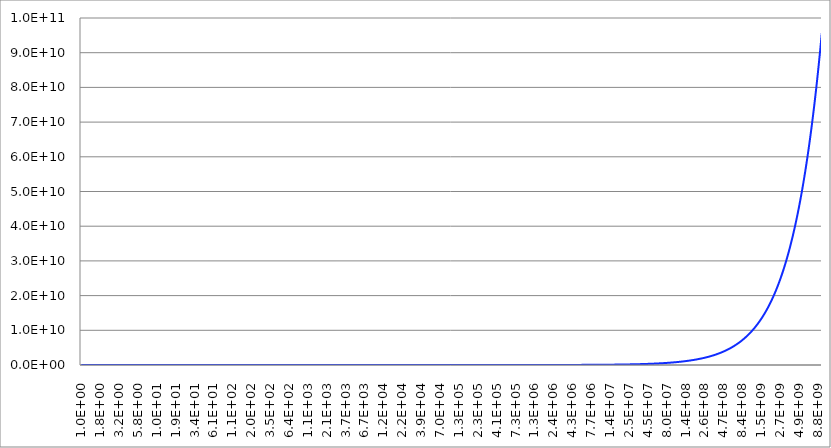
| Category | Series 1 | Series 0 | Series 2 |
|---|---|---|---|
| 1.0 |  |  | -0.108 |
| 1.011579454259899 |  |  | -0.137 |
| 1.023292992280754 |  |  | -0.161 |
| 1.035142166679344 |  |  | -0.181 |
| 1.0471285480509 |  |  | -0.197 |
| 1.059253725177289 |  |  | -0.21 |
| 1.071519305237607 |  |  | -0.219 |
| 1.083926914021204 |  |  | -0.226 |
| 1.096478196143186 |  |  | -0.23 |
| 1.109174815262402 |  |  | -0.232 |
| 1.122018454301964 |  |  | -0.232 |
| 1.135010815672316 |  |  | -0.231 |
| 1.148153621496884 |  |  | -0.228 |
| 1.161448613840344 |  |  | -0.224 |
| 1.174897554939531 |  |  | -0.219 |
| 1.18850222743702 |  |  | -0.213 |
| 1.202264434617414 |  |  | -0.207 |
| 1.216186000646369 |  |  | -0.2 |
| 1.230268770812383 |  |  | -0.192 |
| 1.244514611771387 |  |  | -0.184 |
| 1.258925411794169 |  |  | -0.176 |
| 1.273503081016663 |  |  | -0.167 |
| 1.288249551693136 |  |  | -0.158 |
| 1.303166778452301 |  |  | -0.149 |
| 1.31825673855641 |  |  | -0.14 |
| 1.333521432163326 |  |  | -0.131 |
| 1.348962882591656 |  |  | -0.121 |
| 1.364583136588927 |  |  | -0.112 |
| 1.380384264602887 |  |  | -0.102 |
| 1.39636836105594 |  |  | -0.092 |
| 1.412537544622757 |  |  | -0.082 |
| 1.428893958511106 |  |  | -0.072 |
| 1.445439770745931 |  |  | -0.062 |
| 1.462177174456721 |  |  | -0.052 |
| 1.479108388168211 |  |  | -0.042 |
| 1.496235656094437 |  |  | -0.031 |
| 1.513561248436212 |  |  | -0.021 |
| 1.531087461682034 |  |  | -0.01 |
| 1.548816618912485 |  |  | 0 |
| 1.566751070108153 |  |  | 0.011 |
| 1.584893192461118 |  |  | 0.022 |
| 1.603245390690046 |  |  | 0.033 |
| 1.621810097358934 |  |  | 0.044 |
| 1.640589773199544 |  |  | 0.055 |
| 1.659586907437565 |  |  | 0.066 |
| 1.678804018122565 |  |  | 0.078 |
| 1.698243652461749 |  |  | 0.089 |
| 1.717908387157593 |  |  | 0.101 |
| 1.737800828749381 |  |  | 0.112 |
| 1.757923613958698 |  |  | 0.124 |
| 1.778279410038928 |  |  | 0.136 |
| 1.798870915128794 |  |  | 0.148 |
| 1.81970085860999 |  |  | 0.161 |
| 1.840772001468962 |  |  | 0.173 |
| 1.862087136662874 |  |  | 0.185 |
| 1.883649089489807 |  |  | 0.198 |
| 1.905460717963254 |  |  | 0.211 |
| 1.927524913190943 |  |  | 0.224 |
| 1.949844599758053 |  |  | 0.237 |
| 1.972422736114861 |  |  | 0.25 |
| 1.995262314968887 |  |  | 0.263 |
| 2.018366363681569 |  |  | 0.277 |
| 2.041737944669537 |  |  | 0.291 |
| 2.065380155810538 |  |  | 0.305 |
| 2.089296130854049 |  |  | 0.319 |
| 2.113489039836656 |  |  | 0.333 |
| 2.137962089502242 |  |  | 0.347 |
| 2.16271852372703 |  |  | 0.362 |
| 2.187761623949563 |  |  | 0.377 |
| 2.213094709605648 |  |  | 0.392 |
| 2.23872113856835 |  |  | 0.407 |
| 2.264644307593071 |  |  | 0.422 |
| 2.290867652767784 |  |  | 0.438 |
| 2.31739464996849 |  |  | 0.454 |
| 2.344228815319933 |  |  | 0.47 |
| 2.371373705661667 |  |  | 0.486 |
| 2.398832919019502 |  |  | 0.503 |
| 2.426610095082428 |  |  | 0.52 |
| 2.454708915685043 |  |  | 0.537 |
| 2.483133105295583 |  |  | 0.554 |
| 2.511886431509593 |  |  | 0.571 |
| 2.540972705549318 |  |  | 0.589 |
| 2.570395782768878 |  |  | 0.607 |
| 2.600159563165286 |  |  | 0.626 |
| 2.630267991895396 |  |  | 0.644 |
| 2.660725059798824 |  |  | 0.663 |
| 2.69153480392693 |  |  | 0.682 |
| 2.722701308077927 |  |  | 0.701 |
| 2.754228703338182 |  |  | 0.721 |
| 2.786121168629786 |  |  | 0.741 |
| 2.818382931264471 |  |  | 0.761 |
| 2.851018267503926 |  |  | 0.782 |
| 2.884031503126623 |  |  | 0.803 |
| 2.917427014001185 |  |  | 0.824 |
| 2.951209226666404 |  |  | 0.846 |
| 2.985382618917978 |  |  | 0.868 |
| 3.019951720402035 |  |  | 0.89 |
| 3.054921113215533 |  |  | 0.913 |
| 3.09029543251361 |  |  | 0.936 |
| 3.126079367123975 |  |  | 0.959 |
| 3.1622776601684 |  |  | 0.983 |
| 3.198895109691419 |  |  | 1.007 |
| 3.235936569296304 |  |  | 1.031 |
| 3.273406948788404 |  |  | 1.056 |
| 3.311311214825934 |  |  | 1.081 |
| 3.3496543915783 |  |  | 1.107 |
| 3.388441561392049 |  |  | 1.133 |
| 3.427677865464528 |  |  | 1.159 |
| 3.467368504525341 |  |  | 1.186 |
| 3.507518739525706 |  |  | 1.213 |
| 3.548133892335781 |  |  | 1.241 |
| 3.589219346450079 |  |  | 1.269 |
| 3.63078054770104 |  |  | 1.298 |
| 3.672823004980874 |  |  | 1.327 |
| 3.715352290971754 |  |  | 1.357 |
| 3.75837404288447 |  |  | 1.387 |
| 3.801893963205642 |  |  | 1.417 |
| 3.845917820453566 |  |  | 1.448 |
| 3.890451449942837 |  |  | 1.48 |
| 3.935500754557806 |  |  | 1.512 |
| 3.981071705535005 |  |  | 1.544 |
| 4.027170343254624 |  |  | 1.578 |
| 4.07380277804116 |  |  | 1.611 |
| 4.120975190973336 |  |  | 1.645 |
| 4.16869383470339 |  |  | 1.68 |
| 4.216965034285859 |  |  | 1.716 |
| 4.265795188015963 |  |  | 1.751 |
| 4.31519076827769 |  |  | 1.788 |
| 4.365158322401698 |  |  | 1.825 |
| 4.415704473533164 |  |  | 1.863 |
| 4.466835921509672 |  |  | 1.901 |
| 4.518559443749264 |  |  | 1.94 |
| 4.570881896148792 |  |  | 1.98 |
| 4.623810213992645 |  |  | 2.02 |
| 4.677351412872025 |  |  | 2.061 |
| 4.731512589614848 |  |  | 2.102 |
| 4.786300923226428 |  |  | 2.144 |
| 4.84172367584104 |  |  | 2.187 |
| 4.897788193684508 |  |  | 2.231 |
| 4.95450190804795 |  |  | 2.275 |
| 5.011872336272772 |  |  | 2.321 |
| 5.069907082747093 |  |  | 2.366 |
| 5.128613839913699 |  |  | 2.413 |
| 5.188000389289662 |  |  | 2.46 |
| 5.248074602497778 |  |  | 2.508 |
| 5.308844442309936 |  |  | 2.557 |
| 5.370317963702581 |  |  | 2.607 |
| 5.432503314924386 |  |  | 2.658 |
| 5.495408738576301 |  |  | 2.709 |
| 5.559042572704092 |  |  | 2.761 |
| 5.623413251903548 |  |  | 2.814 |
| 5.688529308438473 |  |  | 2.868 |
| 5.754399373371628 |  |  | 2.923 |
| 5.821032177708775 |  |  | 2.979 |
| 5.888436553555951 |  |  | 3.035 |
| 5.956621435290166 |  |  | 3.093 |
| 6.025595860743641 |  |  | 3.152 |
| 6.095368972401756 |  |  | 3.211 |
| 6.165950018614887 |  |  | 3.272 |
| 6.237348354824258 |  |  | 3.333 |
| 6.309573444802 |  |  | 3.395 |
| 6.382634861905555 |  |  | 3.459 |
| 6.456542290346624 |  |  | 3.523 |
| 6.531305526474794 |  |  | 3.589 |
| 6.606934480076032 |  |  | 3.656 |
| 6.683439175686219 |  |  | 3.723 |
| 6.760829753919892 |  |  | 3.792 |
| 6.839116472814368 |  |  | 3.862 |
| 6.918309709189442 |  |  | 3.933 |
| 6.998419960022813 |  |  | 4.005 |
| 7.079457843841459 |  |  | 4.079 |
| 7.161434102129101 |  |  | 4.153 |
| 7.244359600749983 |  |  | 4.229 |
| 7.328245331389124 |  |  | 4.306 |
| 7.41310241300926 |  |  | 4.385 |
| 7.498942093324645 |  |  | 4.464 |
| 7.585775750291926 |  |  | 4.545 |
| 7.673614893618279 |  |  | 4.627 |
| 7.762471166287009 |  |  | 4.711 |
| 7.852356346100811 |  |  | 4.796 |
| 7.94328234724291 |  |  | 4.882 |
| 8.035261221856269 |  |  | 4.97 |
| 8.12830516164109 |  |  | 5.059 |
| 8.222426499470812 |  |  | 5.149 |
| 8.31763771102681 |  |  | 5.241 |
| 8.413951416452054 |  |  | 5.335 |
| 8.51138038202387 |  |  | 5.43 |
| 8.609937521846113 |  |  | 5.526 |
| 8.709635899560915 |  |  | 5.624 |
| 8.81048873008025 |  |  | 5.724 |
| 8.912509381337568 |  |  | 5.825 |
| 9.015711376059683 |  |  | 5.928 |
| 9.120108393559214 |  |  | 6.032 |
| 9.22571427154775 |  |  | 6.139 |
| 9.33254300797003 |  |  | 6.247 |
| 9.440608762859357 |  |  | 6.356 |
| 9.549925860214485 |  |  | 6.468 |
| 9.66050878989826 |  |  | 6.581 |
| 9.772372209558236 |  |  | 6.696 |
| 9.88553094656952 |  |  | 6.812 |
| 10.00000000000014 |  |  | 6.931 |
| 10.11579454259912 |  |  | 7.052 |
| 10.23292992280768 |  |  | 7.174 |
| 10.35142166679358 |  |  | 7.299 |
| 10.47128548050914 |  |  | 7.425 |
| 10.59253725177304 |  |  | 7.553 |
| 10.71519305237621 |  |  | 7.684 |
| 10.83926914021219 |  |  | 7.816 |
| 10.96478196143201 |  |  | 7.951 |
| 11.09174815262417 |  |  | 8.088 |
| 11.2201845430198 |  |  | 8.227 |
| 11.35010815672332 |  |  | 8.368 |
| 11.481536214969 |  |  | 8.511 |
| 11.6144861384036 |  |  | 8.657 |
| 11.74897554939547 |  |  | 8.805 |
| 11.88502227437036 |  |  | 8.955 |
| 12.02264434617431 |  |  | 9.108 |
| 12.16186000646386 |  |  | 9.263 |
| 12.302687708124 |  |  | 9.42 |
| 12.44514611771404 |  |  | 9.58 |
| 12.58925411794186 |  |  | 9.743 |
| 12.73503081016681 |  |  | 9.908 |
| 12.88249551693154 |  |  | 10.076 |
| 13.03166778452319 |  |  | 10.246 |
| 13.18256738556427 |  |  | 10.419 |
| 13.33521432163345 |  |  | 10.595 |
| 13.48962882591675 |  |  | 10.773 |
| 13.64583136588946 |  |  | 10.954 |
| 13.80384264602906 |  |  | 11.138 |
| 13.9636836105596 |  |  | 11.325 |
| 14.12537544622777 |  |  | 11.515 |
| 14.28893958511125 |  |  | 11.708 |
| 14.4543977074595 |  |  | 11.903 |
| 14.62177174456741 |  |  | 12.102 |
| 14.79108388168231 |  |  | 12.304 |
| 14.96235656094458 |  |  | 12.509 |
| 15.13561248436233 |  |  | 12.717 |
| 15.31087461682055 |  |  | 12.929 |
| 15.48816618912507 |  |  | 13.144 |
| 15.66751070108175 |  |  | 13.362 |
| 15.8489319246114 |  |  | 13.583 |
| 16.03245390690068 |  |  | 13.808 |
| 16.21810097358957 |  |  | 14.037 |
| 16.40589773199567 |  |  | 14.268 |
| 16.59586907437589 |  |  | 14.504 |
| 16.78804018122589 |  |  | 14.743 |
| 16.98243652461773 |  |  | 14.986 |
| 17.17908387157618 |  |  | 15.232 |
| 17.37800828749405 |  |  | 15.483 |
| 17.57923613958723 |  |  | 15.737 |
| 17.78279410038954 |  |  | 15.995 |
| 17.98870915128819 |  |  | 16.257 |
| 18.19700858610015 |  |  | 16.523 |
| 18.40772001468988 |  |  | 16.793 |
| 18.620871366629 |  |  | 17.068 |
| 18.83649089489834 |  |  | 17.346 |
| 19.05460717963281 |  |  | 17.629 |
| 19.2752491319097 |  |  | 17.916 |
| 19.4984459975808 |  |  | 18.207 |
| 19.72422736114889 |  |  | 18.503 |
| 19.95262314968916 |  |  | 18.804 |
| 20.18366363681598 |  |  | 19.109 |
| 20.41737944669567 |  |  | 19.418 |
| 20.65380155810567 |  |  | 19.733 |
| 20.89296130854078 |  |  | 20.052 |
| 21.13489039836686 |  |  | 20.376 |
| 21.37962089502272 |  |  | 20.705 |
| 21.62718523727061 |  |  | 21.039 |
| 21.87761623949594 |  |  | 21.378 |
| 22.1309470960568 |  |  | 21.722 |
| 22.38721138568382 |  |  | 22.071 |
| 22.64644307593103 |  |  | 22.426 |
| 22.90867652767817 |  |  | 22.786 |
| 23.17394649968523 |  |  | 23.152 |
| 23.44228815319967 |  |  | 23.523 |
| 23.71373705661701 |  |  | 23.899 |
| 23.98832919019537 |  |  | 24.281 |
| 24.26610095082463 |  |  | 24.669 |
| 24.54708915685078 |  |  | 25.063 |
| 24.83133105295619 |  |  | 25.463 |
| 25.1188643150963 |  |  | 25.869 |
| 25.40972705549355 |  |  | 26.281 |
| 25.70395782768914 |  |  | 26.699 |
| 26.00159563165323 |  |  | 27.123 |
| 26.30267991895434 |  |  | 27.554 |
| 26.60725059798863 |  |  | 27.991 |
| 26.9153480392697 |  |  | 28.435 |
| 27.22701308077967 |  |  | 28.886 |
| 27.54228703338222 |  |  | 29.343 |
| 27.86121168629827 |  |  | 29.807 |
| 28.18382931264512 |  |  | 30.278 |
| 28.51018267503968 |  |  | 30.756 |
| 28.84031503126666 |  |  | 31.241 |
| 29.17427014001227 |  |  | 31.733 |
| 29.51209226666447 |  |  | 32.233 |
| 29.85382618918022 |  |  | 32.74 |
| 30.19951720402079 |  |  | 33.255 |
| 30.54921113215577 |  |  | 33.777 |
| 30.90295432513656 |  |  | 34.307 |
| 31.26079367124021 |  |  | 34.845 |
| 31.62277660168446 |  |  | 35.391 |
| 31.98895109691466 |  |  | 35.945 |
| 32.35936569296351 |  |  | 36.507 |
| 32.73406948788452 |  |  | 37.078 |
| 33.1131121482598 |  |  | 37.657 |
| 33.49654391578348 |  |  | 38.245 |
| 33.88441561392099 |  |  | 38.841 |
| 34.27677865464577 |  |  | 39.446 |
| 34.67368504525391 |  |  | 40.061 |
| 35.07518739525756 |  |  | 40.684 |
| 35.48133892335832 |  |  | 41.316 |
| 35.8921934645013 |  |  | 41.958 |
| 36.30780547701093 |  |  | 42.609 |
| 36.72823004980927 |  |  | 43.27 |
| 37.15352290971808 |  |  | 43.94 |
| 37.58374042884525 |  |  | 44.621 |
| 38.01893963205697 |  |  | 45.311 |
| 38.45917820453622 |  |  | 46.012 |
| 38.90451449942894 |  |  | 46.722 |
| 39.35500754557864 |  |  | 47.444 |
| 39.81071705535063 |  |  | 48.175 |
| 40.27170343254683 |  |  | 48.918 |
| 40.7380277804122 |  |  | 49.671 |
| 41.20975190973397 |  |  | 50.436 |
| 41.6869383470345 |  |  | 51.212 |
| 42.1696503428592 |  |  | 51.999 |
| 42.65795188016025 |  |  | 52.797 |
| 43.15190768277753 |  |  | 53.607 |
| 43.65158322401761 |  |  | 54.429 |
| 44.15704473533228 |  |  | 55.263 |
| 44.66835921509736 |  |  | 56.109 |
| 45.1855944374933 |  |  | 56.968 |
| 45.70881896148858 |  |  | 57.839 |
| 46.23810213992712 |  |  | 58.723 |
| 46.77351412872092 |  |  | 59.619 |
| 47.31512589614917 |  |  | 60.529 |
| 47.86300923226497 |  |  | 61.452 |
| 48.41723675841109 |  |  | 62.388 |
| 48.9778819368458 |  |  | 63.338 |
| 49.54501908048021 |  |  | 64.302 |
| 50.11872336272843 |  |  | 65.279 |
| 50.69907082747165 |  |  | 66.271 |
| 51.28613839913772 |  |  | 67.277 |
| 51.88000389289737 |  |  | 68.298 |
| 52.48074602497854 |  |  | 69.333 |
| 53.08844442310013 |  |  | 70.384 |
| 53.70317963702659 |  |  | 71.45 |
| 54.32503314924465 |  |  | 72.531 |
| 54.95408738576381 |  |  | 73.627 |
| 55.59042572704172 |  |  | 74.74 |
| 56.2341325190363 |  |  | 75.869 |
| 56.88529308438555 |  |  | 77.013 |
| 57.54399373371712 |  |  | 78.175 |
| 58.21032177708859 |  |  | 79.353 |
| 58.88436553556037 |  |  | 80.548 |
| 59.56621435290254 |  |  | 81.76 |
| 60.2559586074373 |  |  | 82.99 |
| 60.95368972401845 |  |  | 84.237 |
| 61.65950018614977 |  |  | 85.503 |
| 62.37348354824351 |  |  | 86.786 |
| 63.09573444802092 |  |  | 88.088 |
| 63.8263486190565 |  |  | 89.409 |
| 64.56542290346721 |  |  | 90.748 |
| 65.3130552647489 |  |  | 92.107 |
| 66.0693448007613 |  |  | 93.485 |
| 66.83439175686318 |  |  | 94.883 |
| 67.60829753919992 |  |  | 96.301 |
| 68.3911647281447 |  |  | 97.74 |
| 69.18309709189545 |  |  | 99.198 |
| 69.98419960022918 |  |  | 100.678 |
| 70.79457843841564 |  |  | 102.179 |
| 71.61434102129208 |  |  | 103.701 |
| 72.44359600750091 |  |  | 105.245 |
| 73.28245331389235 |  |  | 106.811 |
| 74.13102413009372 |  |  | 108.4 |
| 74.98942093324759 |  |  | 110.011 |
| 75.8577575029204 |  |  | 111.645 |
| 76.73614893618395 |  |  | 113.302 |
| 77.62471166287126 |  |  | 114.983 |
| 78.5235634610093 |  |  | 116.687 |
| 79.4328234724303 |  |  | 118.416 |
| 80.3526122185639 |  |  | 120.17 |
| 81.28305161641214 |  |  | 121.948 |
| 82.22426499470934 |  |  | 123.752 |
| 83.17637711026937 |  |  | 125.581 |
| 84.13951416452181 |  |  | 127.436 |
| 85.11380382023998 |  |  | 129.318 |
| 86.09937521846243 |  |  | 131.226 |
| 87.09635899561044 |  |  | 133.162 |
| 88.10488730080384 |  |  | 135.124 |
| 89.12509381337702 |  |  | 137.115 |
| 90.1571137605982 |  |  | 139.133 |
| 91.20108393559352 |  |  | 141.18 |
| 92.25714271547889 |  |  | 143.257 |
| 93.32543007970172 |  |  | 145.362 |
| 94.40608762859499 |  |  | 147.497 |
| 95.49925860214628 |  |  | 149.663 |
| 96.60508789898407 |  |  | 151.858 |
| 97.72372209558384 |  |  | 154.085 |
| 98.85530946569669 |  |  | 156.344 |
| 100.0000000000028 |  |  | 158.634 |
| 101.1579454259927 |  |  | 160.956 |
| 102.3292992280783 |  |  | 163.311 |
| 103.5142166679373 |  |  | 165.699 |
| 104.712854805093 |  |  | 168.121 |
| 105.9253725177319 |  |  | 170.577 |
| 107.1519305237637 |  |  | 173.067 |
| 108.3926914021235 |  |  | 175.593 |
| 109.6478196143217 |  |  | 178.154 |
| 110.9174815262433 |  |  | 180.751 |
| 112.2018454301996 |  |  | 183.384 |
| 113.5010815672348 |  |  | 186.054 |
| 114.8153621496916 |  |  | 188.762 |
| 116.1448613840377 |  |  | 191.507 |
| 117.4897554939564 |  |  | 194.292 |
| 118.8502227437053 |  |  | 197.115 |
| 120.2264434617448 |  |  | 199.977 |
| 121.6186000646404 |  |  | 202.88 |
| 123.0268770812418 |  |  | 205.823 |
| 124.4514611771422 |  |  | 208.808 |
| 125.8925411794204 |  |  | 211.834 |
| 127.3503081016699 |  |  | 214.903 |
| 128.8249551693172 |  |  | 218.014 |
| 130.3166778452338 |  |  | 221.169 |
| 131.8256738556446 |  |  | 224.368 |
| 133.3521432163364 |  |  | 227.611 |
| 134.8962882591694 |  |  | 230.9 |
| 136.4583136588965 |  |  | 234.234 |
| 138.0384264602926 |  |  | 237.615 |
| 139.636836105598 |  |  | 241.043 |
| 141.2537544622797 |  |  | 244.519 |
| 142.8893958511146 |  |  | 248.043 |
| 144.5439770745971 |  |  | 251.617 |
| 146.2177174456763 |  |  | 255.24 |
| 147.9108388168252 |  |  | 258.913 |
| 149.6235656094479 |  |  | 262.637 |
| 151.3561248436254 |  |  | 266.414 |
| 153.1087461682077 |  |  | 270.242 |
| 154.8816618912529 |  |  | 274.124 |
| 156.6751070108197 |  |  | 278.059 |
| 158.4893192461163 |  |  | 282.05 |
| 160.3245390690091 |  |  | 286.095 |
| 162.181009735898 |  |  | 290.197 |
| 164.058977319959 |  |  | 294.355 |
| 165.9586907437613 |  |  | 298.571 |
| 167.8804018122613 |  |  | 302.846 |
| 169.8243652461798 |  |  | 307.18 |
| 171.7908387157642 |  |  | 311.573 |
| 173.780082874943 |  |  | 316.028 |
| 175.7923613958748 |  |  | 320.544 |
| 177.827941003898 |  |  | 325.122 |
| 179.8870915128845 |  |  | 329.764 |
| 181.9700858610041 |  |  | 334.47 |
| 184.0772001469014 |  |  | 339.24 |
| 186.2087136662927 |  |  | 344.077 |
| 188.3649089489861 |  |  | 348.981 |
| 190.5460717963308 |  |  | 353.952 |
| 192.7524913190998 |  |  | 358.991 |
| 194.9844599758108 |  |  | 364.1 |
| 197.2422736114917 |  |  | 369.28 |
| 199.5262314968944 |  |  | 374.531 |
| 201.8366363681626 |  |  | 379.854 |
| 204.1737944669595 |  |  | 385.25 |
| 206.5380155810597 |  |  | 390.721 |
| 208.9296130854108 |  |  | 396.267 |
| 211.3489039836716 |  |  | 401.889 |
| 213.7962089502302 |  |  | 407.589 |
| 216.2718523727091 |  |  | 413.367 |
| 218.7761623949624 |  |  | 419.224 |
| 221.309470960571 |  |  | 425.162 |
| 223.8721138568413 |  |  | 431.181 |
| 226.4644307593134 |  |  | 437.283 |
| 229.0867652767849 |  |  | 443.468 |
| 231.7394649968555 |  |  | 449.739 |
| 234.422881532 |  |  | 456.095 |
| 237.1373705661734 |  |  | 462.539 |
| 239.8832919019571 |  |  | 469.07 |
| 242.6610095082497 |  |  | 475.692 |
| 245.4708915685113 |  |  | 482.404 |
| 248.3133105295654 |  |  | 489.208 |
| 251.1886431509665 |  |  | 496.105 |
| 254.0972705549391 |  |  | 503.096 |
| 257.0395782768951 |  |  | 510.183 |
| 260.015956316536 |  |  | 517.367 |
| 263.0267991895471 |  |  | 524.649 |
| 266.07250597989 |  |  | 532.031 |
| 269.1534803927007 |  |  | 539.513 |
| 272.2701308078006 |  |  | 547.098 |
| 275.422870333826 |  |  | 554.786 |
| 278.6121168629866 |  |  | 562.579 |
| 281.8382931264551 |  |  | 570.479 |
| 285.1018267504008 |  |  | 578.486 |
| 288.4031503126706 |  |  | 586.602 |
| 291.7427014001268 |  |  | 594.829 |
| 295.1209226666488 |  |  | 603.169 |
| 298.5382618918064 |  |  | 611.621 |
| 301.9951720402122 |  |  | 620.189 |
| 305.492111321562 |  |  | 628.874 |
| 309.0295432513699 |  |  | 637.676 |
| 312.6079367124065 |  |  | 646.599 |
| 316.2277660168491 |  |  | 655.643 |
| 319.8895109691511 |  |  | 664.81 |
| 323.5936569296397 |  |  | 674.101 |
| 327.3406948788498 |  |  | 683.519 |
| 331.1311214826029 |  |  | 693.065 |
| 334.9654391578396 |  |  | 702.74 |
| 338.8441561392146 |  |  | 712.547 |
| 342.7677865464626 |  |  | 722.487 |
| 346.736850452544 |  |  | 732.562 |
| 350.7518739525806 |  |  | 742.774 |
| 354.8133892335882 |  |  | 753.124 |
| 358.9219346450182 |  |  | 763.614 |
| 363.0780547701145 |  |  | 774.247 |
| 367.282300498098 |  |  | 785.024 |
| 371.5352290971861 |  |  | 795.946 |
| 375.8374042884579 |  |  | 807.017 |
| 380.1893963205751 |  |  | 818.238 |
| 384.5917820453677 |  |  | 829.61 |
| 389.0451449942949 |  |  | 841.137 |
| 393.550075455792 |  |  | 852.819 |
| 398.107170553512 |  |  | 864.659 |
| 402.7170343254739 |  |  | 876.66 |
| 407.3802778041278 |  |  | 888.823 |
| 412.0975190973455 |  |  | 901.15 |
| 416.8693834703508 |  |  | 913.643 |
| 421.6965034285979 |  |  | 926.306 |
| 426.5795188016085 |  |  | 939.139 |
| 431.5190768277813 |  |  | 952.146 |
| 436.5158322401822 |  |  | 965.328 |
| 441.570447353329 |  |  | 978.689 |
| 446.6835921509798 |  |  | 992.229 |
| 451.8559443749393 |  |  | 1005.952 |
| 457.0881896148922 |  |  | 1019.86 |
| 462.3810213992777 |  |  | 1033.956 |
| 467.7351412872158 |  |  | 1048.241 |
| 473.1512589614983 |  |  | 1062.719 |
| 478.6300923226564 |  |  | 1077.392 |
| 484.1723675841176 |  |  | 1092.262 |
| 489.7788193684647 |  |  | 1107.333 |
| 495.450190804809 |  |  | 1122.606 |
| 501.1872336272913 |  |  | 1138.085 |
| 506.9907082747236 |  |  | 1153.773 |
| 512.8613839913844 |  |  | 1169.671 |
| 518.800038928981 |  |  | 1185.783 |
| 524.8074602497927 |  |  | 1202.111 |
| 530.8844442310087 |  |  | 1218.659 |
| 537.0317963702734 |  |  | 1235.429 |
| 543.2503314924542 |  |  | 1252.425 |
| 549.5408738576458 |  |  | 1269.649 |
| 555.9042572704251 |  |  | 1287.104 |
| 562.3413251903709 |  |  | 1304.793 |
| 568.8529308438635 |  |  | 1322.719 |
| 575.4399373371793 |  |  | 1340.886 |
| 582.103217770894 |  |  | 1359.297 |
| 588.843655355612 |  |  | 1377.954 |
| 595.6621435290338 |  |  | 1396.862 |
| 602.5595860743814 |  |  | 1416.023 |
| 609.5368972401931 |  |  | 1435.44 |
| 616.5950018615064 |  |  | 1455.118 |
| 623.7348354824439 |  |  | 1475.06 |
| 630.9573444802182 |  |  | 1495.268 |
| 638.263486190574 |  |  | 1515.747 |
| 645.6542290346812 |  |  | 1536.499 |
| 653.1305526474983 |  |  | 1557.53 |
| 660.6934480076224 |  |  | 1578.842 |
| 668.3439175686412 |  |  | 1600.438 |
| 676.0829753920087 |  |  | 1622.324 |
| 683.9116472814567 |  |  | 1644.502 |
| 691.8309709189642 |  |  | 1666.976 |
| 699.8419960023016 |  |  | 1689.751 |
| 707.9457843841662 |  |  | 1712.83 |
| 716.1434102129308 |  |  | 1736.217 |
| 724.4359600750192 |  |  | 1759.916 |
| 732.8245331389337 |  |  | 1783.932 |
| 741.3102413009475 |  |  | 1808.268 |
| 749.8942093324862 |  |  | 1832.928 |
| 758.5775750292144 |  |  | 1857.918 |
| 767.3614893618501 |  |  | 1883.241 |
| 776.2471166287233 |  |  | 1908.902 |
| 785.2356346101038 |  |  | 1934.904 |
| 794.3282347243139 |  |  | 1961.253 |
| 803.5261221856501 |  |  | 1987.953 |
| 812.8305161641325 |  |  | 2015.009 |
| 822.2426499471048 |  |  | 2042.425 |
| 831.763771102705 |  |  | 2070.207 |
| 841.3951416452297 |  |  | 2098.358 |
| 851.1380382024115 |  |  | 2126.883 |
| 860.9937521846362 |  |  | 2155.788 |
| 870.9635899561166 |  |  | 2185.078 |
| 881.0488730080505 |  |  | 2214.757 |
| 891.2509381337824 |  |  | 2244.831 |
| 901.5711376059943 |  |  | 2275.305 |
| 912.0108393559476 |  |  | 2306.183 |
| 922.5714271548015 |  |  | 2337.473 |
| 933.25430079703 |  |  | 2369.177 |
| 944.0608762859628 |  |  | 2401.303 |
| 954.9925860214759 |  |  | 2433.855 |
| 966.0508789898538 |  |  | 2466.84 |
| 977.2372209558516 |  |  | 2500.263 |
| 988.5530946569803 |  |  | 2534.129 |
| 1000.000000000042 |  |  | 2568.444 |
| 1011.579454259941 |  |  | 2603.215 |
| 1023.292992280797 |  |  | 2638.446 |
| 1035.142166679388 |  |  | 2674.145 |
| 1047.128548050944 |  |  | 2710.317 |
| 1059.253725177334 |  |  | 2746.969 |
| 1071.519305237652 |  |  | 2784.106 |
| 1083.92691402125 |  |  | 2821.736 |
| 1096.478196143232 |  |  | 2859.864 |
| 1109.174815262448 |  |  | 2898.496 |
| 1122.018454302011 |  |  | 2937.641 |
| 1135.010815672363 |  |  | 2977.303 |
| 1148.153621496932 |  |  | 3017.49 |
| 1161.448613840392 |  |  | 3058.21 |
| 1174.89755493958 |  |  | 3099.467 |
| 1188.502227437069 |  |  | 3141.271 |
| 1202.264434617464 |  |  | 3183.628 |
| 1216.18600064642 |  |  | 3226.544 |
| 1230.268770812434 |  |  | 3270.028 |
| 1244.514611771438 |  |  | 3314.086 |
| 1258.925411794221 |  |  | 3358.727 |
| 1273.503081016716 |  |  | 3403.958 |
| 1288.24955169319 |  |  | 3449.786 |
| 1303.166778452356 |  |  | 3496.219 |
| 1318.256738556464 |  |  | 3543.265 |
| 1333.521432163382 |  |  | 3590.932 |
| 1348.962882591712 |  |  | 3639.229 |
| 1364.583136588984 |  |  | 3688.162 |
| 1380.384264602945 |  |  | 3737.742 |
| 1396.368361055999 |  |  | 3787.975 |
| 1412.537544622816 |  |  | 3838.871 |
| 1428.893958511165 |  |  | 3890.438 |
| 1445.439770745991 |  |  | 3942.684 |
| 1462.177174456782 |  |  | 3995.62 |
| 1479.108388168273 |  |  | 4049.252 |
| 1496.2356560945 |  |  | 4103.592 |
| 1513.561248436275 |  |  | 4158.647 |
| 1531.087461682098 |  |  | 4214.428 |
| 1548.81661891255 |  |  | 4270.943 |
| 1566.751070108219 |  |  | 4328.202 |
| 1584.893192461184 |  |  | 4386.214 |
| 1603.245390690113 |  |  | 4444.991 |
| 1621.810097359002 |  |  | 4504.54 |
| 1640.589773199612 |  |  | 4564.873 |
| 1659.586907437635 |  |  | 4626 |
| 1678.804018122635 |  |  | 4687.93 |
| 1698.24365246182 |  |  | 4750.675 |
| 1717.908387157665 |  |  | 4814.244 |
| 1737.800828749454 |  |  | 4878.649 |
| 1757.923613958772 |  |  | 4943.901 |
| 1778.279410039003 |  |  | 5010.009 |
| 1798.87091512887 |  |  | 5076.987 |
| 1819.700858610066 |  |  | 5144.843 |
| 1840.772001469039 |  |  | 5213.591 |
| 1862.087136662952 |  |  | 5283.242 |
| 1883.649089489886 |  |  | 5353.806 |
| 1905.460717963334 |  |  | 5425.297 |
| 1927.524913191024 |  |  | 5497.726 |
| 1949.844599758134 |  |  | 5571.106 |
| 1972.422736114944 |  |  | 5645.447 |
| 1995.262314968971 |  |  | 5720.764 |
| 2018.366363681653 |  |  | 5797.068 |
| 2041.737944669623 |  |  | 5874.373 |
| 2065.380155810624 |  |  | 5952.691 |
| 2089.296130854135 |  |  | 6032.036 |
| 2113.489039836744 |  |  | 6112.42 |
| 2137.96208950233 |  |  | 6193.857 |
| 2162.71852372712 |  |  | 6276.361 |
| 2187.761623949653 |  |  | 6359.946 |
| 2213.09470960574 |  |  | 6444.625 |
| 2238.721138568443 |  |  | 6530.413 |
| 2264.644307593165 |  |  | 6617.324 |
| 2290.867652767879 |  |  | 6705.372 |
| 2317.394649968586 |  |  | 6794.572 |
| 2344.228815320031 |  |  | 6884.939 |
| 2371.373705661766 |  |  | 6976.489 |
| 2398.832919019602 |  |  | 7069.236 |
| 2426.610095082529 |  |  | 7163.195 |
| 2454.708915685145 |  |  | 7258.383 |
| 2483.133105295687 |  |  | 7354.816 |
| 2511.886431509698 |  |  | 7452.508 |
| 2540.972705549424 |  |  | 7551.478 |
| 2570.395782768985 |  |  | 7651.74 |
| 2600.159563165395 |  |  | 7753.312 |
| 2630.267991895506 |  |  | 7856.211 |
| 2660.725059798935 |  |  | 7960.454 |
| 2691.534803927043 |  |  | 8066.057 |
| 2722.701308078041 |  |  | 8173.04 |
| 2754.228703338297 |  |  | 8281.418 |
| 2786.121168629903 |  |  | 8391.211 |
| 2818.382931264588 |  |  | 8502.437 |
| 2851.018267504045 |  |  | 8615.114 |
| 2884.031503126743 |  |  | 8729.26 |
| 2917.427014001306 |  |  | 8844.896 |
| 2951.209226666527 |  |  | 8962.039 |
| 2985.382618918103 |  |  | 9080.709 |
| 3019.951720402161 |  |  | 9200.927 |
| 3054.92111321566 |  |  | 9322.711 |
| 3090.29543251374 |  |  | 9446.082 |
| 3126.079367124106 |  |  | 9571.061 |
| 3162.277660168532 |  |  | 9697.667 |
| 3198.895109691553 |  |  | 9825.923 |
| 3235.93656929644 |  |  | 9955.85 |
| 3273.406948788541 |  |  | 10087.468 |
| 3311.311214826072 |  |  | 10220.799 |
| 3349.65439157844 |  |  | 10355.866 |
| 3388.441561392191 |  |  | 10492.691 |
| 3427.677865464671 |  |  | 10631.297 |
| 3467.368504525486 |  |  | 10771.706 |
| 3507.518739525852 |  |  | 10913.941 |
| 3548.133892335928 |  |  | 11058.027 |
| 3589.219346450228 |  |  | 11203.986 |
| 3630.780547701192 |  |  | 11351.844 |
| 3672.823004981028 |  |  | 11501.623 |
| 3715.352290971908 |  |  | 11653.35 |
| 3758.374042884627 |  |  | 11807.048 |
| 3801.8939632058 |  |  | 11962.744 |
| 3845.917820453726 |  |  | 12120.463 |
| 3890.451449942999 |  |  | 12280.231 |
| 3935.50075455797 |  |  | 12442.073 |
| 3981.07170553517 |  |  | 12606.018 |
| 4027.170343254792 |  |  | 12772.092 |
| 4073.80277804133 |  |  | 12940.322 |
| 4120.975190973508 |  |  | 13110.735 |
| 4168.693834703562 |  |  | 13283.361 |
| 4216.965034286033 |  |  | 13458.227 |
| 4265.79518801614 |  |  | 13635.361 |
| 4315.190768277868 |  |  | 13814.794 |
| 4365.158322401878 |  |  | 13996.555 |
| 4415.704473533346 |  |  | 14180.672 |
| 4466.835921509855 |  |  | 14367.178 |
| 4518.559443749451 |  |  | 14556.101 |
| 4570.881896148981 |  |  | 14747.474 |
| 4623.810213992836 |  |  | 14941.327 |
| 4677.351412872218 |  |  | 15137.693 |
| 4731.512589615043 |  |  | 15336.603 |
| 4786.300923226626 |  |  | 15538.09 |
| 4841.72367584124 |  |  | 15742.188 |
| 4897.788193684711 |  |  | 15948.929 |
| 4954.501908048154 |  |  | 16158.348 |
| 5011.872336272977 |  |  | 16370.479 |
| 5069.907082747302 |  |  | 16585.356 |
| 5128.61383991391 |  |  | 16803.014 |
| 5188.000389289876 |  |  | 17023.49 |
| 5248.074602497995 |  |  | 17246.82 |
| 5308.844442310156 |  |  | 17473.039 |
| 5370.317963702803 |  |  | 17702.185 |
| 5432.503314924612 |  |  | 17934.295 |
| 5495.408738576529 |  |  | 18169.407 |
| 5559.042572704323 |  |  | 18407.56 |
| 5623.413251903782 |  |  | 18648.793 |
| 5688.52930843871 |  |  | 18893.144 |
| 5754.399373371868 |  |  | 19140.654 |
| 5821.032177709016 |  |  | 19391.364 |
| 5888.436553556196 |  |  | 19645.313 |
| 5956.621435290415 |  |  | 19902.544 |
| 6025.595860743892 |  |  | 20163.098 |
| 6095.36897240201 |  |  | 20427.018 |
| 6165.950018615144 |  |  | 20694.347 |
| 6237.348354824519 |  |  | 20965.129 |
| 6309.573444802264 |  |  | 21239.407 |
| 6382.634861905822 |  |  | 21517.227 |
| 6456.542290346895 |  |  | 21798.633 |
| 6531.305526475068 |  |  | 22083.671 |
| 6606.934480076309 |  |  | 22372.388 |
| 6683.4391756865 |  |  | 22664.831 |
| 6760.829753920176 |  |  | 22961.046 |
| 6839.116472814656 |  |  | 23261.084 |
| 6918.309709189732 |  |  | 23564.991 |
| 6998.419960023107 |  |  | 23872.818 |
| 7079.457843841757 |  |  | 24184.615 |
| 7161.434102129402 |  |  | 24500.432 |
| 7244.359600750287 |  |  | 24820.321 |
| 7328.245331389433 |  |  | 25144.333 |
| 7413.102413009572 |  |  | 25472.521 |
| 7498.94209332496 |  |  | 25804.939 |
| 7585.775750292245 |  |  | 26141.64 |
| 7673.614893618602 |  |  | 26482.678 |
| 7762.471166287335 |  |  | 26828.111 |
| 7852.35634610114 |  |  | 27177.992 |
| 7943.282347243244 |  |  | 27532.38 |
| 8035.261221856606 |  |  | 27891.331 |
| 8128.305161641432 |  |  | 28254.904 |
| 8222.426499471158 |  |  | 28623.157 |
| 8317.637711027162 |  |  | 28996.15 |
| 8413.95141645241 |  |  | 29373.944 |
| 8511.38038202423 |  |  | 29756.6 |
| 8609.937521846477 |  |  | 30144.18 |
| 8709.635899561283 |  |  | 30536.745 |
| 8810.488730080624 |  |  | 30934.361 |
| 8912.509381337944 |  |  | 31337.091 |
| 9015.711376060064 |  |  | 31745.001 |
| 9120.1083935596 |  |  | 32158.155 |
| 9225.71427154814 |  |  | 32576.622 |
| 9332.543007970426 |  |  | 33000.469 |
| 9440.608762859756 |  |  | 33429.764 |
| 9549.92586021489 |  |  | 33864.576 |
| 9660.508789898671 |  |  | 34304.976 |
| 9772.37220955865 |  |  | 34751.035 |
| 9885.53094656994 |  |  | 35202.825 |
| 10000.00000000056 |  |  | 35660.419 |
| 10115.79454259955 |  |  | 36123.89 |
| 10232.92992280811 |  |  | 36593.313 |
| 10351.42166679402 |  |  | 37068.765 |
| 10471.28548050958 |  |  | 37550.322 |
| 10592.53725177348 |  |  | 38038.061 |
| 10715.19305237667 |  |  | 38532.06 |
| 10839.26914021264 |  |  | 39032.401 |
| 10964.78196143247 |  |  | 39539.163 |
| 11091.74815262464 |  |  | 40052.427 |
| 11220.18454302027 |  |  | 40572.277 |
| 11350.10815672379 |  |  | 41098.796 |
| 11481.53621496948 |  |  | 41632.069 |
| 11614.48613840408 |  |  | 42172.182 |
| 11748.97554939596 |  |  | 42719.221 |
| 11885.02227437086 |  |  | 43273.275 |
| 12022.64434617481 |  |  | 43834.433 |
| 12161.86000646437 |  |  | 44402.784 |
| 12302.68770812451 |  |  | 44978.421 |
| 12445.14611771456 |  |  | 45561.436 |
| 12589.25411794239 |  |  | 46151.922 |
| 12735.03081016734 |  |  | 46749.975 |
| 12882.49551693208 |  |  | 47355.69 |
| 13031.66778452374 |  |  | 47969.165 |
| 13182.56738556483 |  |  | 48590.498 |
| 13335.21432163401 |  |  | 49219.788 |
| 13489.62882591731 |  |  | 49857.138 |
| 13645.83136589003 |  |  | 50502.649 |
| 13803.84264602965 |  |  | 51156.424 |
| 13963.68361056018 |  |  | 51818.569 |
| 14125.37544622836 |  |  | 52489.19 |
| 14288.93958511186 |  |  | 53168.394 |
| 14454.39770746011 |  |  | 53856.29 |
| 14621.77174456803 |  |  | 54552.988 |
| 14791.08388168293 |  |  | 55258.6 |
| 14962.3565609452 |  |  | 55973.239 |
| 15135.61248436296 |  |  | 56697.02 |
| 15310.87461682119 |  |  | 57430.057 |
| 15488.16618912572 |  |  | 58172.47 |
| 15667.5107010824 |  |  | 58924.375 |
| 15848.93192461206 |  |  | 59685.895 |
| 16032.45390690135 |  |  | 60457.15 |
| 16218.10097359025 |  |  | 61238.264 |
| 16405.89773199635 |  |  | 62029.362 |
| 16595.86907437658 |  |  | 62830.57 |
| 16788.04018122658 |  |  | 63642.016 |
| 16982.43652461844 |  |  | 64463.831 |
| 17179.08387157689 |  |  | 65296.145 |
| 17378.00828749477 |  |  | 66139.091 |
| 17579.23613958796 |  |  | 66992.804 |
| 17782.79410039027 |  |  | 67857.42 |
| 17988.70915128893 |  |  | 68733.078 |
| 18197.0085861009 |  |  | 69619.917 |
| 18407.72001469064 |  |  | 70518.078 |
| 18620.87136662977 |  |  | 71427.706 |
| 18836.49089489911 |  |  | 72348.944 |
| 19054.6071796336 |  |  | 73281.941 |
| 19275.2491319105 |  |  | 74226.844 |
| 19498.44599758161 |  |  | 75183.805 |
| 19724.2273611497 |  |  | 76152.975 |
| 19952.62314968998 |  |  | 77134.51 |
| 20183.66363681681 |  |  | 78128.566 |
| 20417.3794466965 |  |  | 79135.301 |
| 20653.80155810652 |  |  | 80154.875 |
| 20892.96130854163 |  |  | 81187.452 |
| 21134.89039836772 |  |  | 82233.194 |
| 21379.6208950236 |  |  | 83292.27 |
| 21627.18523727149 |  |  | 84364.847 |
| 21877.61623949683 |  |  | 85451.095 |
| 22130.9470960577 |  |  | 86551.189 |
| 22387.21138568473 |  |  | 87665.302 |
| 22646.44307593195 |  |  | 88793.612 |
| 22908.6765276791 |  |  | 89936.299 |
| 23173.94649968617 |  |  | 91093.543 |
| 23442.28815320062 |  |  | 92265.53 |
| 23713.73705661797 |  |  | 93452.444 |
| 23988.32919019635 |  |  | 94654.476 |
| 24266.10095082561 |  |  | 95871.815 |
| 24547.08915685178 |  |  | 97104.655 |
| 24831.3310529572 |  |  | 98353.192 |
| 25118.86431509731 |  |  | 99617.624 |
| 25409.72705549458 |  |  | 100898.151 |
| 25703.95782769019 |  |  | 102194.978 |
| 26001.5956316543 |  |  | 103508.309 |
| 26302.67991895541 |  |  | 104838.353 |
| 26607.25059798971 |  |  | 106185.322 |
| 26915.34803927079 |  |  | 107549.427 |
| 27227.01308078078 |  |  | 108930.887 |
| 27542.28703338334 |  |  | 110329.92 |
| 27861.2116862994 |  |  | 111746.747 |
| 28183.82931264625 |  |  | 113181.594 |
| 28510.18267504083 |  |  | 114634.686 |
| 28840.31503126782 |  |  | 116106.256 |
| 29174.27014001345 |  |  | 117596.535 |
| 29512.09226666566 |  |  | 119105.76 |
| 29853.82618918143 |  |  | 120634.17 |
| 30199.51720402201 |  |  | 122182.006 |
| 30549.21113215701 |  |  | 123749.514 |
| 30902.95432513781 |  |  | 125336.941 |
| 31260.79367124147 |  |  | 126944.539 |
| 31622.77660168574 |  |  | 128572.562 |
| 31988.95109691595 |  |  | 130221.267 |
| 32359.36569296482 |  |  | 131890.916 |
| 32734.06948788584 |  |  | 133581.771 |
| 33113.11214826116 |  |  | 135294.101 |
| 33496.54391578484 |  |  | 137028.176 |
| 33884.41561392235 |  |  | 138784.27 |
| 34276.77865464716 |  |  | 140562.661 |
| 34673.68504525532 |  |  | 142363.628 |
| 35075.18739525898 |  |  | 144187.458 |
| 35481.33892335975 |  |  | 146034.437 |
| 35892.19346450276 |  |  | 147904.857 |
| 36307.8054770124 |  |  | 149799.014 |
| 36728.23004981076 |  |  | 151717.206 |
| 37153.52290971958 |  |  | 153659.736 |
| 37583.74042884677 |  |  | 155626.911 |
| 38018.9396320585 |  |  | 157619.04 |
| 38459.17820453777 |  |  | 159636.438 |
| 38904.5144994305 |  |  | 161679.424 |
| 39355.00754558022 |  |  | 163748.318 |
| 39810.71705535223 |  |  | 165843.448 |
| 40271.70343254845 |  |  | 167965.143 |
| 40738.02778041385 |  |  | 170113.737 |
| 41209.75190973563 |  |  | 172289.57 |
| 41686.93834703617 |  |  | 174492.984 |
| 42169.6503428609 |  |  | 176724.325 |
| 42657.95188016197 |  |  | 178983.946 |
| 43151.90768277926 |  |  | 181272.202 |
| 43651.58322401937 |  |  | 183589.452 |
| 44157.04473533405 |  |  | 185936.063 |
| 44668.35921509915 |  |  | 188312.402 |
| 45185.59443749511 |  |  | 190718.845 |
| 45708.81896149041 |  |  | 193155.768 |
| 46238.10213992898 |  |  | 195623.557 |
| 46773.51412872281 |  |  | 198122.598 |
| 47315.12589615108 |  |  | 200653.284 |
| 47863.0092322669 |  |  | 203216.014 |
| 48417.23675841304 |  |  | 205811.19 |
| 48977.88193684776 |  |  | 208439.22 |
| 49545.01908048221 |  |  | 211100.517 |
| 50118.72336273045 |  |  | 213795.498 |
| 50699.0708274737 |  |  | 216524.588 |
| 51286.13839913979 |  |  | 219288.214 |
| 51880.00389289945 |  |  | 222086.811 |
| 52480.74602498065 |  |  | 224920.818 |
| 53088.44442310226 |  |  | 227790.68 |
| 53703.17963702875 |  |  | 230696.846 |
| 54325.03314924684 |  |  | 233639.774 |
| 54954.08738576602 |  |  | 236619.924 |
| 55590.42572704397 |  |  | 239637.765 |
| 56234.13251903856 |  |  | 242693.769 |
| 56885.29308438785 |  |  | 245788.416 |
| 57543.99373371944 |  |  | 248922.19 |
| 58210.32177709094 |  |  | 252095.584 |
| 58884.36553556274 |  |  | 255309.093 |
| 59566.21435290494 |  |  | 258563.223 |
| 60255.95860743972 |  |  | 261858.483 |
| 60953.68972402091 |  |  | 265195.388 |
| 61659.50018615227 |  |  | 268574.462 |
| 62373.48354824602 |  |  | 271996.233 |
| 63095.73444802348 |  |  | 275461.239 |
| 63826.34861905907 |  |  | 278970.02 |
| 64565.42290346981 |  |  | 282523.126 |
| 65313.05526475154 |  |  | 286121.113 |
| 66069.34480076397 |  |  | 289764.544 |
| 66834.39175686587 |  |  | 293453.99 |
| 67608.29753920266 |  |  | 297190.027 |
| 68391.16472814747 |  |  | 300973.239 |
| 69183.09709189823 |  |  | 304804.219 |
| 69984.199600232 |  |  | 308683.564 |
| 70794.5784384185 |  |  | 312611.883 |
| 71614.34102129498 |  |  | 316589.788 |
| 72443.59600750385 |  |  | 320617.901 |
| 73282.4533138953 |  |  | 324696.851 |
| 74131.02413009672 |  |  | 328827.277 |
| 74989.42093325061 |  |  | 333009.822 |
| 75857.75750292347 |  |  | 337245.141 |
| 76736.14893618703 |  |  | 341533.894 |
| 77624.7116628744 |  |  | 345876.752 |
| 78523.56346101247 |  |  | 350274.391 |
| 79432.8234724335 |  |  | 354727.5 |
| 80352.61221856714 |  |  | 359236.771 |
| 81283.0516164154 |  |  | 363802.91 |
| 82224.26499471266 |  |  | 368426.628 |
| 83176.3771102727 |  |  | 373108.647 |
| 84139.5141645252 |  |  | 377849.697 |
| 85113.80382024341 |  |  | 382650.517 |
| 86099.3752184659 |  |  | 387511.855 |
| 87096.35899561396 |  |  | 392434.47 |
| 88104.88730080739 |  |  | 397419.129 |
| 89125.0938133806 |  |  | 402466.609 |
| 90157.1137606018 |  |  | 407577.696 |
| 91201.08393559718 |  |  | 412753.186 |
| 92257.14271548261 |  |  | 417993.885 |
| 93325.43007970547 |  |  | 423300.611 |
| 94406.0876285988 |  |  | 428674.189 |
| 95499.25860215013 |  |  | 434115.455 |
| 96605.08789898796 |  |  | 439625.258 |
| 97723.72209558777 |  |  | 445204.454 |
| 98855.30946570067 |  |  | 450853.913 |
| 100000.0000000069 |  |  | 456574.512 |
| 101157.9454259968 |  |  | 462367.143 |
| 102329.2992280825 |  |  | 468232.705 |
| 103514.2166679415 |  |  | 474172.113 |
| 104712.8548050972 |  |  | 480186.288 |
| 105925.3725177362 |  |  | 486276.167 |
| 107151.930523768 |  |  | 492442.696 |
| 108392.6914021278 |  |  | 498686.834 |
| 109647.8196143261 |  |  | 505009.552 |
| 110917.4815262478 |  |  | 511411.831 |
| 112201.8454302041 |  |  | 517894.667 |
| 113501.0815672394 |  |  | 524459.066 |
| 114815.3621496962 |  |  | 531106.05 |
| 116144.8613840423 |  |  | 537836.649 |
| 117489.7554939611 |  |  | 544651.909 |
| 118850.2227437101 |  |  | 551552.889 |
| 120226.4434617497 |  |  | 558540.659 |
| 121618.6000646453 |  |  | 565616.305 |
| 123026.8770812467 |  |  | 572780.924 |
| 124451.4611771472 |  |  | 580035.628 |
| 125892.5411794255 |  |  | 587381.543 |
| 127350.3081016751 |  |  | 594819.809 |
| 128824.9551693224 |  |  | 602351.578 |
| 130316.6778452391 |  |  | 609978.021 |
| 131825.6738556499 |  |  | 617700.318 |
| 133352.1432163418 |  |  | 625519.668 |
| 134896.2882591748 |  |  | 633437.282 |
| 136458.3136589021 |  |  | 641454.387 |
| 138038.4264602982 |  |  | 649572.227 |
| 139636.8361056036 |  |  | 657792.06 |
| 141253.7544622854 |  |  | 666115.157 |
| 142889.3958511204 |  |  | 674542.811 |
| 144543.977074603 |  |  | 683076.324 |
| 146217.7174456821 |  |  | 691717.02 |
| 147910.8388168312 |  |  | 700466.235 |
| 149623.5656094539 |  |  | 709325.326 |
| 151356.1248436316 |  |  | 718295.663 |
| 153108.7461682139 |  |  | 727378.634 |
| 154881.6618912592 |  |  | 736575.646 |
| 156675.1070108261 |  |  | 745888.121 |
| 158489.3192461227 |  |  | 755317.501 |
| 160324.5390690156 |  |  | 764865.243 |
| 162181.0097359046 |  |  | 774532.826 |
| 164058.9773199657 |  |  | 784321.744 |
| 165958.690743768 |  |  | 794233.511 |
| 167880.4018122681 |  |  | 804269.659 |
| 169824.3652461866 |  |  | 814431.74 |
| 171790.8387157712 |  |  | 824721.325 |
| 173780.0828749501 |  |  | 835140.004 |
| 175792.3613958819 |  |  | 845689.387 |
| 177827.9410039051 |  |  | 856371.103 |
| 179887.0915128918 |  |  | 867186.804 |
| 181970.0858610115 |  |  | 878138.16 |
| 184077.200146909 |  |  | 889226.862 |
| 186208.7136663002 |  |  | 900454.622 |
| 188364.9089489937 |  |  | 911823.175 |
| 190546.0717963385 |  |  | 923334.275 |
| 192752.4913191076 |  |  | 934989.7 |
| 194984.4599758187 |  |  | 946791.248 |
| 197242.2736114997 |  |  | 958740.74 |
| 199526.2314969025 |  |  | 970840.021 |
| 201836.6363681708 |  |  | 983090.957 |
| 204173.7944669678 |  |  | 995495.438 |
| 206538.015581068 |  |  | 1008055.377 |
| 208929.6130854192 |  |  | 1020772.711 |
| 211348.9039836801 |  |  | 1033649.401 |
| 213796.2089502389 |  |  | 1046687.433 |
| 216271.8523727179 |  |  | 1059888.816 |
| 218776.1623949713 |  |  | 1073255.586 |
| 221309.47096058 |  |  | 1086789.802 |
| 223872.1138568504 |  |  | 1100493.55 |
| 226464.4307593226 |  |  | 1114368.942 |
| 229086.7652767941 |  |  | 1128418.114 |
| 231739.4649968649 |  |  | 1142643.232 |
| 234422.8815320095 |  |  | 1157046.486 |
| 237137.370566183 |  |  | 1171630.094 |
| 239883.2919019667 |  |  | 1186396.303 |
| 242661.0095082594 |  |  | 1201347.384 |
| 245470.8915685211 |  |  | 1216485.64 |
| 248313.3105295753 |  |  | 1231813.401 |
| 251188.6431509765 |  |  | 1247333.025 |
| 254097.2705549493 |  |  | 1263046.901 |
| 257039.5782769054 |  |  | 1278957.448 |
| 260015.9563165464 |  |  | 1295067.111 |
| 263026.7991895576 |  |  | 1311378.369 |
| 266072.5059799007 |  |  | 1327893.732 |
| 269153.4803927115 |  |  | 1344615.738 |
| 272270.1308078115 |  |  | 1361546.96 |
| 275422.8703338372 |  |  | 1378689.999 |
| 278612.1168629978 |  |  | 1396047.491 |
| 281838.2931264664 |  |  | 1413622.105 |
| 285101.8267504122 |  |  | 1431416.54 |
| 288403.1503126821 |  |  | 1449433.532 |
| 291742.7014001385 |  |  | 1467675.849 |
| 295120.9226666606 |  |  | 1486146.293 |
| 298538.2618918183 |  |  | 1504847.701 |
| 301995.1720402242 |  |  | 1523782.946 |
| 305492.1113215743 |  |  | 1542954.935 |
| 309029.5432513822 |  |  | 1562366.613 |
| 312607.936712419 |  |  | 1582020.959 |
| 316227.7660168617 |  |  | 1601920.991 |
| 319889.510969164 |  |  | 1622069.763 |
| 323593.6569296527 |  |  | 1642470.368 |
| 327340.6948788629 |  |  | 1663125.935 |
| 331131.1214826161 |  |  | 1684039.635 |
| 334965.439157853 |  |  | 1705214.676 |
| 338844.1561392282 |  |  | 1726654.305 |
| 342767.7865464763 |  |  | 1748361.812 |
| 346736.850452558 |  |  | 1770340.525 |
| 350751.8739525946 |  |  | 1792593.815 |
| 354813.3892336024 |  |  | 1815125.094 |
| 358921.9346450325 |  |  | 1837937.815 |
| 363078.054770129 |  |  | 1861035.475 |
| 367282.3004981126 |  |  | 1884421.615 |
| 371535.2290972008 |  |  | 1908099.818 |
| 375837.4042884728 |  |  | 1932073.713 |
| 380189.3963205902 |  |  | 1956346.973 |
| 384591.7820453829 |  |  | 1980923.315 |
| 389045.1449943103 |  |  | 2005806.505 |
| 393550.0754558076 |  |  | 2031000.353 |
| 398107.1705535277 |  |  | 2056508.717 |
| 402717.0343254899 |  |  | 2082335.504 |
| 407380.277804144 |  |  | 2108484.667 |
| 412097.5190973618 |  |  | 2134960.209 |
| 416869.3834703674 |  |  | 2161766.183 |
| 421696.5034286146 |  |  | 2188906.691 |
| 426579.5188016255 |  |  | 2216385.887 |
| 431519.0768277984 |  |  | 2244207.974 |
| 436515.8322401996 |  |  | 2272377.209 |
| 441570.4473533466 |  |  | 2300897.902 |
| 446683.5921509976 |  |  | 2329774.415 |
| 451855.9443749573 |  |  | 2359011.163 |
| 457088.1896149104 |  |  | 2388612.619 |
| 462381.0213992961 |  |  | 2418583.307 |
| 467735.1412872344 |  |  | 2448927.81 |
| 473151.2589615172 |  |  | 2479650.767 |
| 478630.0923226755 |  |  | 2510756.872 |
| 484172.367584137 |  |  | 2542250.881 |
| 489778.8193684843 |  |  | 2574137.605 |
| 495450.1908048288 |  |  | 2606421.917 |
| 501187.2336273113 |  |  | 2639108.749 |
| 506990.7082747439 |  |  | 2672203.094 |
| 512861.3839914048 |  |  | 2705710.006 |
| 518800.0389290016 |  |  | 2739634.604 |
| 524807.4602498136 |  |  | 2773982.067 |
| 530884.4442310298 |  |  | 2808757.64 |
| 537031.7963702948 |  |  | 2843966.632 |
| 543250.3314924758 |  |  | 2879614.417 |
| 549540.8738576676 |  |  | 2915706.437 |
| 555904.2572704472 |  |  | 2952248.2 |
| 562341.3251903933 |  |  | 2989245.281 |
| 568852.9308438862 |  |  | 3026703.327 |
| 575439.9373372023 |  |  | 3064628.051 |
| 582103.2177709173 |  |  | 3103025.24 |
| 588843.6553556354 |  |  | 3141900.749 |
| 595662.1435290575 |  |  | 3181260.507 |
| 602559.5860744053 |  |  | 3221110.517 |
| 609536.8972402173 |  |  | 3261456.856 |
| 616595.001861531 |  |  | 3302305.673 |
| 623734.8354824685 |  |  | 3343663.196 |
| 630957.344480243 |  |  | 3385535.73 |
| 638263.4861905993 |  |  | 3427929.655 |
| 645654.2290347067 |  |  | 3470851.432 |
| 653130.552647524 |  |  | 3514307.602 |
| 660693.4480076483 |  |  | 3558304.785 |
| 668343.9175686677 |  |  | 3602849.684 |
| 676082.9753920354 |  |  | 3647949.083 |
| 683911.6472814836 |  |  | 3693609.852 |
| 691830.9709189915 |  |  | 3739838.945 |
| 699841.996002329 |  |  | 3786643.4 |
| 707945.7843841943 |  |  | 3834030.344 |
| 716143.410212959 |  |  | 3882006.992 |
| 724435.9600750477 |  |  | 3930580.645 |
| 732824.5331389626 |  |  | 3979758.698 |
| 741310.2413009767 |  |  | 4029548.634 |
| 749894.2093325157 |  |  | 4079958.031 |
| 758577.5750292444 |  |  | 4130994.557 |
| 767361.4893618803 |  |  | 4182665.978 |
| 776247.116628754 |  |  | 4234980.154 |
| 785235.6346101348 |  |  | 4287945.042 |
| 794328.2347243452 |  |  | 4341568.698 |
| 803526.1221856818 |  |  | 4395859.276 |
| 812830.5161641646 |  |  | 4450825.031 |
| 822242.6499471373 |  |  | 4506474.32 |
| 831763.771102738 |  |  | 4562815.603 |
| 841395.141645263 |  |  | 4619857.444 |
| 851138.038202445 |  |  | 4677608.513 |
| 860993.7521846702 |  |  | 4736077.586 |
| 870963.5899561511 |  |  | 4795273.548 |
| 881048.8730080854 |  |  | 4855205.394 |
| 891250.9381338177 |  |  | 4915882.228 |
| 901571.13760603 |  |  | 4977313.268 |
| 912010.8393559837 |  |  | 5039507.844 |
| 922571.427154838 |  |  | 5102475.402 |
| 933254.3007970668 |  |  | 5166225.505 |
| 944060.876286 |  |  | 5230767.832 |
| 954992.5860215136 |  |  | 5296112.182 |
| 966050.8789898921 |  |  | 5362268.476 |
| 977237.2209558903 |  |  | 5429246.755 |
| 988553.0946570195 |  |  | 5497057.185 |
| 1000000.00000008 |  |  | 5565710.058 |
| 1011579.45425998 |  |  | 5635215.79 |
| 1023292.99228084 |  |  | 5705584.929 |
| 1035142.16667943 |  |  | 5776828.15 |
| 1047128.54805099 |  |  | 5848956.26 |
| 1059253.72517738 |  |  | 5921980.2 |
| 1071519.30523769 |  |  | 5995911.046 |
| 1083926.91402129 |  |  | 6070760.008 |
| 1096478.19614328 |  |  | 6146538.437 |
| 1109174.81526249 |  |  | 6223257.822 |
| 1122018.45430206 |  |  | 6300929.793 |
| 1135010.81567241 |  |  | 6379566.126 |
| 1148153.62149698 |  |  | 6459178.738 |
| 1161448.61384044 |  |  | 6539779.696 |
| 1174897.55493963 |  |  | 6621381.213 |
| 1188502.22743712 |  |  | 6703995.655 |
| 1202264.43461751 |  |  | 6787635.538 |
| 1216186.00064647 |  |  | 6872313.533 |
| 1230268.77081248 |  |  | 6958042.467 |
| 1244514.61177149 |  |  | 7044835.324 |
| 1258925.41179427 |  |  | 7132705.249 |
| 1273503.08101677 |  |  | 7221665.548 |
| 1288249.55169324 |  |  | 7311729.692 |
| 1303166.77845241 |  |  | 7402911.315 |
| 1318256.73855652 |  |  | 7495224.221 |
| 1333521.43216344 |  |  | 7588682.383 |
| 1348962.88259177 |  |  | 7683299.948 |
| 1364583.13658904 |  |  | 7779091.233 |
| 1380384.264603 |  |  | 7876070.735 |
| 1396368.36105605 |  |  | 7974253.127 |
| 1412537.54462287 |  |  | 8073653.264 |
| 1428893.95851122 |  |  | 8174286.181 |
| 1445439.77074605 |  |  | 8276167.102 |
| 1462177.17445684 |  |  | 8379311.436 |
| 1479108.38816833 |  |  | 8483734.78 |
| 1496235.65609456 |  |  | 8589452.927 |
| 1513561.24843634 |  |  | 8696481.859 |
| 1531087.46168216 |  |  | 8804837.76 |
| 1548816.61891261 |  |  | 8914537.008 |
| 1566751.07010828 |  |  | 9025596.186 |
| 1584893.19246125 |  |  | 9138032.079 |
| 1603245.39069018 |  |  | 9251861.679 |
| 1621810.09735907 |  |  | 9367102.188 |
| 1640589.77319968 |  |  | 9483771.017 |
| 1659586.9074377 |  |  | 9601885.793 |
| 1678804.0181227 |  |  | 9721464.359 |
| 1698243.65246189 |  |  | 9842524.778 |
| 1717908.38715773 |  |  | 9965085.335 |
| 1737800.82874952 |  |  | 10089164.537 |
| 1757923.61395884 |  |  | 10214781.123 |
| 1778279.41003907 |  |  | 10341954.06 |
| 1798870.91512894 |  |  | 10470702.547 |
| 1819700.85861014 |  |  | 10601046.021 |
| 1840772.00146911 |  |  | 10733004.157 |
| 1862087.13666303 |  |  | 10866596.872 |
| 1883649.08948996 |  |  | 11001844.328 |
| 1905460.71796341 |  |  | 11138766.933 |
| 1927524.9131911 |  |  | 11277385.348 |
| 1949844.59975821 |  |  | 11417720.487 |
| 1972422.73611502 |  |  | 11559793.521 |
| 1995262.31496905 |  |  | 11703625.882 |
| 2018366.36368174 |  |  | 11849239.262 |
| 2041737.94466971 |  |  | 11996655.624 |
| 2065380.15581071 |  |  | 12145897.198 |
| 2089296.13085422 |  |  | 12296986.488 |
| 2113489.03983683 |  |  | 12449946.274 |
| 2137962.08950242 |  |  | 12604799.616 |
| 2162718.52372721 |  |  | 12761569.858 |
| 2187761.62394974 |  |  | 12920280.628 |
| 2213094.70960583 |  |  | 13080955.848 |
| 2238721.13856853 |  |  | 13243619.732 |
| 2264644.30759326 |  |  | 13408296.79 |
| 2290867.65276797 |  |  | 13575011.836 |
| 2317394.64996868 |  |  | 13743789.986 |
| 2344228.81532013 |  |  | 13914656.665 |
| 2371373.70566186 |  |  | 14087637.612 |
| 2398832.9190197 |  |  | 14262758.88 |
| 2426610.09508263 |  |  | 14440046.842 |
| 2454708.91568524 |  |  | 14619528.196 |
| 2483133.10529579 |  |  | 14801229.968 |
| 2511886.4315098 |  |  | 14985179.513 |
| 2540972.70554953 |  |  | 15171404.525 |
| 2570395.78276909 |  |  | 15359933.036 |
| 2600159.5631655 |  |  | 15550793.423 |
| 2630267.99189561 |  |  | 15744014.412 |
| 2660725.05979904 |  |  | 15939625.08 |
| 2691534.80392715 |  |  | 16137654.861 |
| 2722701.30807815 |  |  | 16338133.551 |
| 2754228.70333841 |  |  | 16541091.312 |
| 2786121.16863002 |  |  | 16746558.675 |
| 2818382.9312647 |  |  | 16954566.548 |
| 2851018.26750416 |  |  | 17165146.214 |
| 2884031.50312686 |  |  | 17378329.344 |
| 2917427.01400143 |  |  | 17594147.996 |
| 2951209.22666665 |  |  | 17812634.622 |
| 2985382.61891823 |  |  | 18033822.07 |
| 3019951.72040229 |  |  | 18257743.593 |
| 3054921.11321579 |  |  | 18484432.853 |
| 3090295.43251387 |  |  | 18713923.922 |
| 3126079.36712423 |  |  | 18946251.292 |
| 3162277.66016866 |  |  | 19181449.877 |
| 3198895.10969168 |  |  | 19419555.021 |
| 3235936.56929657 |  |  | 19660602.5 |
| 3273406.94878867 |  |  | 19904628.529 |
| 3311311.21482621 |  |  | 20151669.768 |
| 3349654.39157858 |  |  | 20401763.325 |
| 3388441.56139233 |  |  | 20654946.765 |
| 3427677.86546481 |  |  | 20911258.112 |
| 3467368.50452563 |  |  | 21170735.858 |
| 3507518.739526 |  |  | 21433418.966 |
| 3548133.89233607 |  |  | 21699346.877 |
| 3589219.34645038 |  |  | 21968559.515 |
| 3630780.54770134 |  |  | 22241097.294 |
| 3672823.00498118 |  |  | 22517001.125 |
| 3715352.29097206 |  |  | 22796312.417 |
| 3758374.04288478 |  |  | 23079073.091 |
| 3801893.96320596 |  |  | 23365325.578 |
| 3845917.82045388 |  |  | 23655112.833 |
| 3890451.44994316 |  |  | 23948478.333 |
| 3935500.75455813 |  |  | 24245466.093 |
| 3981071.70553533 |  |  | 24546120.664 |
| 4027170.34325496 |  |  | 24850487.143 |
| 4073802.7780415 |  |  | 25158611.182 |
| 4120975.19097368 |  |  | 25470538.992 |
| 4168693.83470373 |  |  | 25786317.349 |
| 4216965.03428621 |  |  | 26105993.602 |
| 4265795.18801632 |  |  | 26429615.683 |
| 4315190.76827805 |  |  | 26757232.109 |
| 4365158.32240206 |  |  | 27088891.992 |
| 4415704.47353353 |  |  | 27424645.046 |
| 4466835.92151004 |  |  | 27764541.595 |
| 4518559.44374964 |  |  | 28108632.578 |
| 4570881.89614917 |  |  | 28456969.558 |
| 4623810.21399303 |  |  | 28809604.733 |
| 4677351.41287241 |  |  | 29166590.936 |
| 4731512.58961524 |  |  | 29527981.65 |
| 4786300.92322682 |  |  | 29893831.014 |
| 4841723.67584144 |  |  | 30264193.827 |
| 4897788.19368491 |  |  | 30639125.561 |
| 4954501.90804836 |  |  | 31018682.37 |
| 5011872.33627318 |  |  | 31402921.091 |
| 5069907.08274751 |  |  | 31791899.26 |
| 5128613.83991412 |  |  | 32185675.118 |
| 5188000.38929009 |  |  | 32584307.619 |
| 5248074.60249821 |  |  | 32987856.437 |
| 5308844.44231037 |  |  | 33396381.979 |
| 5370317.96370302 |  |  | 33809945.392 |
| 5432503.31492484 |  |  | 34228608.571 |
| 5495408.73857675 |  |  | 34652434.167 |
| 5559042.57270455 |  |  | 35081485.602 |
| 5623413.25190401 |  |  | 35515827.071 |
| 5688529.30843894 |  |  | 35955523.558 |
| 5754399.3733721 |  |  | 36400640.841 |
| 5821032.17770926 |  |  | 36851245.503 |
| 5888436.55355644 |  |  | 37307404.942 |
| 5956621.43529066 |  |  | 37769187.384 |
| 6025595.86074414 |  |  | 38236661.886 |
| 6095368.97240226 |  |  | 38709898.353 |
| 6165950.0186154 |  |  | 39188967.546 |
| 6237348.35482477 |  |  | 39673941.09 |
| 6309573.44480252 |  |  | 40164891.488 |
| 6382634.86190608 |  |  | 40661892.131 |
| 6456542.29034716 |  |  | 41165017.308 |
| 6531305.52647533 |  |  | 41674342.215 |
| 6606934.48007658 |  |  | 42189942.972 |
| 6683439.17568677 |  |  | 42711896.628 |
| 6760829.75392045 |  |  | 43240281.175 |
| 6839116.47281494 |  |  | 43775175.56 |
| 6918309.70919001 |  |  | 44316659.696 |
| 6998419.96002339 |  |  | 44864814.475 |
| 7079457.84384205 |  |  | 45419721.776 |
| 7161434.10212969 |  |  | 45981464.482 |
| 7244359.60075058 |  |  | 46550126.489 |
| 7328245.33138973 |  |  | 47125792.721 |
| 7413102.41300988 |  |  | 47708549.139 |
| 7498942.09332527 |  |  | 48298482.756 |
| 7585775.75029256 |  |  | 48895681.652 |
| 7673614.89361892 |  |  | 49500234.98 |
| 7762471.16628765 |  |  | 50112232.987 |
| 7852356.34610146 |  |  | 50731767.023 |
| 7943282.34724357 |  |  | 51358929.555 |
| 8035261.22185694 |  |  | 51993814.181 |
| 8128305.16164177 |  |  | 52636515.644 |
| 8222426.49947149 |  |  | 53287129.846 |
| 8317637.7110275 |  |  | 53945753.861 |
| 8413951.41645275 |  |  | 54612485.952 |
| 8511380.38202458 |  |  | 55287425.581 |
| 8609937.52184683 |  |  | 55970673.429 |
| 8709635.89956164 |  |  | 56662331.405 |
| 8810488.73008099 |  |  | 57362502.668 |
| 8912509.38133831 |  |  | 58071291.634 |
| 9015711.37606043 |  |  | 58788804.001 |
| 9120108.39355997 |  |  | 59515146.753 |
| 9225714.27154852 |  |  | 60250428.188 |
| 9332543.00797081 |  |  | 60994757.925 |
| 9440608.76286014 |  |  | 61748246.922 |
| 9549925.86021528 |  |  | 62511007.496 |
| 9660508.78989906 |  |  | 63283153.336 |
| 9772372.20955905 |  |  | 64064799.52 |
| 9885530.94657034 |  |  | 64856062.534 |
| 10000000.000001 |  |  | 65657060.287 |
| 10115794.5426 |  |  | 66467912.13 |
| 10232929.9228085 |  |  | 67288738.872 |
| 10351421.6667944 |  |  | 68119662.798 |
| 10471285.48051 |  |  | 68960807.688 |
| 10592537.2517739 |  |  | 69812298.836 |
| 10715193.0523771 |  |  | 70674263.066 |
| 10839269.1402131 |  |  | 71546828.752 |
| 10964781.9614329 |  |  | 72430125.836 |
| 11091748.1526251 |  |  | 73324285.85 |
| 11220184.5430207 |  |  | 74229441.93 |
| 11350108.1567243 |  |  | 75145728.842 |
| 11481536.2149699 |  |  | 76073282.996 |
| 11614486.1384046 |  |  | 77012242.471 |
| 11748975.5493964 |  |  | 77962747.031 |
| 11885022.2743713 |  |  | 78924938.149 |
| 12022644.3461753 |  |  | 79898959.025 |
| 12161860.0064649 |  |  | 80884954.609 |
| 12302687.708125 |  |  | 81883071.623 |
| 12445146.1177151 |  |  | 82893458.58 |
| 12589254.1179429 |  |  | 83916265.805 |
| 12735030.8101679 |  |  | 84951645.464 |
| 12882495.5169326 |  |  | 85999751.577 |
| 13031667.7845243 |  |  | 87060740.049 |
| 13182567.3855654 |  |  | 88134768.686 |
| 13335214.3216346 |  |  | 89221997.223 |
| 13489628.8259179 |  |  | 90322587.346 |
| 13645831.3658906 |  |  | 91436702.715 |
| 13803842.6460302 |  |  | 92564508.987 |
| 13963683.6105608 |  |  | 93706173.846 |
| 14125375.4462289 |  |  | 94861867.02 |
| 14288939.5851124 |  |  | 96031760.311 |
| 14454397.7074607 |  |  | 97216027.618 |
| 14621771.7445686 |  |  | 98414844.965 |
| 14791083.8816835 |  |  | 99628390.522 |
| 14962356.5609458 |  |  | 100856844.639 |
| 15135612.4843636 |  |  | 102100389.863 |
| 15310874.6168218 |  |  | 103359210.973 |
| 15488166.1891264 |  |  | 104633495.002 |
| 15667510.7010831 |  |  | 105923431.267 |
| 15848931.9246127 |  |  | 107229211.397 |
| 16032453.906902 |  |  | 108551029.358 |
| 16218100.9735909 |  |  | 109889081.484 |
| 16405897.731997 |  |  | 111243566.508 |
| 16595869.0743773 |  |  | 112614685.585 |
| 16788040.1812273 |  |  | 114002642.329 |
| 16982436.5246191 |  |  | 115407642.837 |
| 17179083.8715776 |  |  | 116829895.72 |
| 17378008.2874955 |  |  | 118269612.137 |
| 17579236.1395887 |  |  | 119727005.824 |
| 17782794.100391 |  |  | 121202293.124 |
| 17988709.1512897 |  |  | 122695693.021 |
| 18197008.5861017 |  |  | 124207427.171 |
| 18407720.0146914 |  |  | 125737719.935 |
| 18620871.3666306 |  |  | 127286798.41 |
| 18836490.8948999 |  |  | 128854892.467 |
| 19054607.1796344 |  |  | 130442234.778 |
| 19275249.1319113 |  |  | 132049060.857 |
| 19498445.9975824 |  |  | 133675609.089 |
| 19724227.3611505 |  |  | 135322120.769 |
| 19952623.1496908 |  |  | 136988840.134 |
| 20183663.6368177 |  |  | 138676014.402 |
| 20417379.4466974 |  |  | 140383893.807 |
| 20653801.5581074 |  |  | 142112731.634 |
| 20892961.3085425 |  |  | 143862784.257 |
| 21134890.3983686 |  |  | 145634311.181 |
| 21379620.8950245 |  |  | 147427575.072 |
| 21627185.2372724 |  |  | 149242841.802 |
| 21877616.2394977 |  |  | 151080380.485 |
| 22130947.0960586 |  |  | 152940463.517 |
| 22387211.3856857 |  |  | 154823366.617 |
| 22646443.0759329 |  |  | 156729368.866 |
| 22908676.5276801 |  |  | 158658752.748 |
| 23173946.4996871 |  |  | 160611804.192 |
| 23442288.1532016 |  |  | 162588812.615 |
| 23713737.056619 |  |  | 164590070.96 |
| 23988329.1901973 |  |  | 166615875.746 |
| 24266100.9508266 |  |  | 168666527.104 |
| 24547089.1568528 |  |  | 170742328.826 |
| 24831331.0529582 |  |  | 172843588.41 |
| 25118864.3150984 |  |  | 174970617.099 |
| 25409727.0554956 |  |  | 177123729.932 |
| 25703957.8276913 |  |  | 179303245.792 |
| 26001595.6316554 |  |  | 181509487.444 |
| 26302679.9189565 |  |  | 183742781.592 |
| 26607250.5979908 |  |  | 186003458.921 |
| 26915348.0392719 |  |  | 188291854.147 |
| 27227013.0807819 |  |  | 190608306.066 |
| 27542287.0333845 |  |  | 192953157.604 |
| 27861211.6863006 |  |  | 195326755.866 |
| 28183829.3126474 |  |  | 197729452.188 |
| 28510182.675042 |  |  | 200161602.19 |
| 28840315.031269 |  |  | 202623565.823 |
| 29174270.1400147 |  |  | 205115707.427 |
| 29512092.2666669 |  |  | 207638395.781 |
| 29853826.1891827 |  |  | 210192004.159 |
| 30199517.2040233 |  |  | 212776910.383 |
| 30549211.1321583 |  |  | 215393496.881 |
| 30902954.3251391 |  |  | 218042150.738 |
| 31260793.6712428 |  |  | 220723263.758 |
| 31622776.6016871 |  |  | 223437232.518 |
| 31988951.0969173 |  |  | 226184458.428 |
| 32359365.6929662 |  |  | 228965347.788 |
| 32734069.4878872 |  |  | 231780311.847 |
| 33113112.1482625 |  |  | 234629766.868 |
| 33496543.9157862 |  |  | 237514134.181 |
| 33884415.6139238 |  |  | 240433840.252 |
| 34276778.6546486 |  |  | 243389316.742 |
| 34673685.0452568 |  |  | 246381000.568 |
| 35075187.3952605 |  |  | 249409333.971 |
| 35481338.9233612 |  |  | 252474764.581 |
| 35892193.4645043 |  |  | 255577745.476 |
| 36307805.4770139 |  |  | 258718735.257 |
| 36728230.0498123 |  |  | 261898198.109 |
| 37153522.9097211 |  |  | 265116603.869 |
| 37583740.4288483 |  |  | 268374428.099 |
| 38018939.6320601 |  |  | 271672152.152 |
| 38459178.2045394 |  |  | 275010263.242 |
| 38904514.4994321 |  |  | 278389254.519 |
| 39355007.5455819 |  |  | 281809625.136 |
| 39810717.0553539 |  |  | 285271880.325 |
| 40271703.4325501 |  |  | 288776531.472 |
| 40738027.7804156 |  |  | 292324096.188 |
| 41209751.9097374 |  |  | 295915098.388 |
| 41686938.3470379 |  |  | 299550068.366 |
| 42169650.3428627 |  |  | 303229542.873 |
| 42657951.8801638 |  |  | 306954065.194 |
| 43151907.6827811 |  |  | 310724185.229 |
| 43651583.2240212 |  |  | 314540459.575 |
| 44157044.7353359 |  |  | 318403451.603 |
| 44668359.215101 |  |  | 322313731.543 |
| 45185594.437497 |  |  | 326271876.566 |
| 45708818.9614923 |  |  | 330278470.871 |
| 46238102.1399309 |  |  | 334334105.768 |
| 46773514.1287248 |  |  | 338439379.763 |
| 47315125.8961531 |  |  | 342594898.65 |
| 47863009.2322689 |  |  | 346801275.594 |
| 48417236.7584151 |  |  | 351059131.225 |
| 48977881.9368498 |  |  | 355369093.726 |
| 49545019.0804843 |  |  | 359731798.927 |
| 50118723.3627326 |  |  | 364147890.394 |
| 50699070.8274758 |  |  | 368618019.528 |
| 51286138.3991419 |  |  | 373142845.656 |
| 51880003.8929016 |  |  | 377723036.128 |
| 52480746.0249829 |  |  | 382359266.417 |
| 53088444.4231045 |  |  | 387052220.214 |
| 53703179.637031 |  |  | 391802589.532 |
| 54325033.1492491 |  |  | 396611074.801 |
| 54954087.3857683 |  |  | 401478384.976 |
| 55590425.7270463 |  |  | 406405237.639 |
| 56234132.5190409 |  |  | 411392359.101 |
| 56885293.0843902 |  |  | 416440484.51 |
| 57543993.7337218 |  |  | 421550357.96 |
| 58210321.7770934 |  |  | 426722732.595 |
| 58884365.5355652 |  |  | 431958370.726 |
| 59566214.3529074 |  |  | 437258043.932 |
| 60255958.6074422 |  |  | 442622533.183 |
| 60953689.7240235 |  |  | 448052628.948 |
| 61659500.1861548 |  |  | 453549131.31 |
| 62373483.5482486 |  |  | 459112850.087 |
| 63095734.4480261 |  |  | 464744604.946 |
| 63826348.6190617 |  |  | 470445225.523 |
| 64565422.9034725 |  |  | 476215551.546 |
| 65313055.2647543 |  |  | 482056432.958 |
| 66069344.8007667 |  |  | 487968730.037 |
| 66834391.7568687 |  |  | 493953313.523 |
| 67608297.5392055 |  |  | 500011064.75 |
| 68391164.7281503 |  |  | 506142875.766 |
| 69183097.0919011 |  |  | 512349649.468 |
| 69984199.6002349 |  |  | 518632299.735 |
| 70794578.4384214 |  |  | 524991751.558 |
| 71614341.0212979 |  |  | 531428941.176 |
| 72443596.0075068 |  |  | 537944816.21 |
| 73282453.3138983 |  |  | 544540335.809 |
| 74131024.1300998 |  |  | 551216470.779 |
| 74989420.9332537 |  |  | 557974203.732 |
| 75857757.5029266 |  |  | 564814529.228 |
| 76736148.9361902 |  |  | 571738453.917 |
| 77624711.6628776 |  |  | 578746996.689 |
| 78523563.4610157 |  |  | 585841188.82 |
| 79432823.4724368 |  |  | 593022074.125 |
| 80352612.2185705 |  |  | 600290709.106 |
| 81283051.6164188 |  |  | 607648163.111 |
| 82224264.9947161 |  |  | 615095518.485 |
| 83176377.1102762 |  |  | 622633870.73 |
| 84139514.1645287 |  |  | 630264328.665 |
| 85113803.820247 |  |  | 637988014.587 |
| 86099375.2184695 |  |  | 645806064.434 |
| 87096358.9956176 |  |  | 653719627.951 |
| 88104887.3008111 |  |  | 661729868.855 |
| 89125093.8133843 |  |  | 669837965.011 |
| 90157113.7606056 |  |  | 678045108.595 |
| 91201083.935601 |  |  | 686352506.273 |
| 92257142.7154864 |  |  | 694761379.376 |
| 93325430.0797094 |  |  | 703272964.078 |
| 94406087.6286027 |  |  | 711888511.573 |
| 95499258.6021541 |  |  | 720609288.262 |
| 96605087.8989919 |  |  | 729436575.931 |
| 97723722.0955918 |  |  | 738371671.945 |
| 98855309.4657047 |  |  | 747415889.432 |
| 100000000.000011 |  |  | 756570557.474 |
| 101157945.426001 |  |  | 765837021.303 |
| 102329299.228087 |  |  | 775216642.495 |
| 103514216.667946 |  |  | 784710799.169 |
| 104712854.805102 |  |  | 794320886.186 |
| 105925372.517741 |  |  | 804048315.355 |
| 107151930.523772 |  |  | 813894515.635 |
| 108392691.402132 |  |  | 823860933.345 |
| 109647819.614331 |  |  | 833949032.375 |
| 110917481.526252 |  |  | 844160294.395 |
| 112201845.430209 |  |  | 854496219.076 |
| 113501081.567244 |  |  | 864958324.304 |
| 114815362.149701 |  |  | 875548146.405 |
| 116144861.384047 |  |  | 886267240.362 |
| 117489755.493966 |  |  | 897117180.048 |
| 118850222.743715 |  |  | 908099558.451 |
| 120226443.461755 |  |  | 919215987.905 |
| 121618600.06465 |  |  | 930468100.329 |
| 123026877.081252 |  |  | 941857547.459 |
| 124451461.177152 |  |  | 953386001.092 |
| 125892541.179431 |  |  | 965055153.326 |
| 127350308.10168 |  |  | 976866716.809 |
| 128824955.169328 |  |  | 988822424.987 |
| 130316677.845244 |  |  | 1000924032.354 |
| 131825673.855655 |  |  | 1013173314.71 |
| 133352143.216347 |  |  | 1025572069.418 |
| 134896288.25918 |  |  | 1038122115.663 |
| 136458313.658908 |  |  | 1050825294.722 |
| 138038426.460304 |  |  | 1063683470.226 |
| 139636836.105609 |  |  | 1076698528.434 |
| 141253754.462291 |  |  | 1089872378.504 |
| 142889395.851126 |  |  | 1103206952.776 |
| 144543977.074609 |  |  | 1116704207.046 |
| 146217717.445688 |  |  | 1130366120.857 |
| 147910838.816837 |  |  | 1144194697.78 |
| 149623565.60946 |  |  | 1158191965.712 |
| 151356124.843638 |  |  | 1172359977.163 |
| 153108746.16822 |  |  | 1186700809.562 |
| 154881661.891266 |  |  | 1201216565.552 |
| 156675107.010833 |  |  | 1215909373.3 |
| 158489319.246129 |  |  | 1230781386.804 |
| 160324539.069022 |  |  | 1245834786.208 |
| 162181009.735911 |  |  | 1261071778.115 |
| 164058977.319972 |  |  | 1276494595.91 |
| 165958690.743775 |  |  | 1292105500.086 |
| 167880401.812275 |  |  | 1307906778.568 |
| 169824365.246194 |  |  | 1323900747.049 |
| 171790838.715778 |  |  | 1340089749.323 |
| 173780082.874957 |  |  | 1356476157.63 |
| 175792361.395889 |  |  | 1373062372.994 |
| 177827941.003912 |  |  | 1389850825.579 |
| 179887091.512899 |  |  | 1406843975.035 |
| 181970085.861019 |  |  | 1424044310.859 |
| 184077200.146916 |  |  | 1441454352.757 |
| 186208713.666308 |  |  | 1459076651.007 |
| 188364908.949001 |  |  | 1476913786.829 |
| 190546071.796346 |  |  | 1494968372.764 |
| 192752491.319116 |  |  | 1513243053.048 |
| 194984459.975827 |  |  | 1531740504 |
| 197242273.611508 |  |  | 1550463434.408 |
| 199526231.496911 |  |  | 1569414585.921 |
| 201836636.368179 |  |  | 1588596733.45 |
| 204173794.466976 |  |  | 1608012685.57 |
| 206538015.581076 |  |  | 1627665284.925 |
| 208929613.085428 |  |  | 1647557408.643 |
| 211348903.983689 |  |  | 1667691968.752 |
| 213796208.950248 |  |  | 1688071912.604 |
| 216271852.372727 |  |  | 1708700223.3 |
| 218776162.39498 |  |  | 1729579920.127 |
| 221309470.960589 |  |  | 1750714058.99 |
| 223872113.85686 |  |  | 1772105732.863 |
| 226464430.759332 |  |  | 1793758072.229 |
| 229086765.276804 |  |  | 1815674245.541 |
| 231739464.996874 |  |  | 1837857459.678 |
| 234422881.532019 |  |  | 1860310960.411 |
| 237137370.566193 |  |  | 1883038032.874 |
| 239883291.901977 |  |  | 1906042002.039 |
| 242661009.508269 |  |  | 1929326233.202 |
| 245470891.568531 |  |  | 1952894132.464 |
| 248313310.529586 |  |  | 1976749147.233 |
| 251188643.150987 |  |  | 2000894766.717 |
| 254097270.55496 |  |  | 2025334522.434 |
| 257039578.276916 |  |  | 2050071988.724 |
| 260015956.316557 |  |  | 2075110783.263 |
| 263026799.189568 |  |  | 2100454567.592 |
| 266072505.979912 |  |  | 2126107047.647 |
| 269153480.392723 |  |  | 2152071974.293 |
| 272270130.807823 |  |  | 2178353143.872 |
| 275422870.333848 |  |  | 2204954398.749 |
| 278612116.863009 |  |  | 2231879627.874 |
| 281838293.126478 |  |  | 2259132767.338 |
| 285101826.750424 |  |  | 2286717800.953 |
| 288403150.312694 |  |  | 2314638760.82 |
| 291742701.40015 |  |  | 2342899727.92 |
| 295120922.666673 |  |  | 2371504832.703 |
| 298538261.891831 |  |  | 2400458255.684 |
| 301995172.040237 |  |  | 2429764228.052 |
| 305492111.321587 |  |  | 2459427032.284 |
| 309029543.251395 |  |  | 2489451002.76 |
| 312607936.712432 |  |  | 2519840526.397 |
| 316227766.016875 |  |  | 2550600043.278 |
| 319889510.969177 |  |  | 2581734047.304 |
| 323593656.929666 |  |  | 2613247086.834 |
| 327340694.878876 |  |  | 2645143765.354 |
| 331131121.48263 |  |  | 2677428742.137 |
| 334965439.157867 |  |  | 2710106732.921 |
| 338844156.139242 |  |  | 2743182510.589 |
| 342767786.54649 |  |  | 2776660905.863 |
| 346736850.452572 |  |  | 2810546808.004 |
| 350751873.952609 |  |  | 2844845165.516 |
| 354813389.233617 |  |  | 2879560986.866 |
| 358921934.645047 |  |  | 2914699341.209 |
| 363078054.770144 |  |  | 2950265359.119 |
| 367282300.498128 |  |  | 2986264233.336 |
| 371535229.097216 |  |  | 3022701219.513 |
| 375837404.288488 |  |  | 3059581636.981 |
| 380189396.320606 |  |  | 3096910869.515 |
| 384591782.045399 |  |  | 3134694366.12 |
| 389045144.994326 |  |  | 3172937641.809 |
| 393550075.455824 |  |  | 3211646278.413 |
| 398107170.553544 |  |  | 3250825925.379 |
| 402717034.325506 |  |  | 3290482300.594 |
| 407380277.804161 |  |  | 3330621191.209 |
| 412097519.097379 |  |  | 3371248454.478 |
| 416869383.470384 |  |  | 3412370018.606 |
| 421696503.428632 |  |  | 3453991883.605 |
| 426579518.801643 |  |  | 3496120122.162 |
| 431519076.827816 |  |  | 3538760880.521 |
| 436515832.240217 |  |  | 3581920379.368 |
| 441570447.353365 |  |  | 3625604914.733 |
| 446683592.151016 |  |  | 3669820858.902 |
| 451855944.374976 |  |  | 3714574661.334 |
| 457088189.614929 |  |  | 3759872849.601 |
| 462381021.399315 |  |  | 3805722030.326 |
| 467735141.287253 |  |  | 3852128890.142 |
| 473151258.961536 |  |  | 3899100196.656 |
| 478630092.322695 |  |  | 3946642799.432 |
| 484172367.584157 |  |  | 3994763630.979 |
| 489778819.368504 |  |  | 4043469707.753 |
| 495450190.804849 |  |  | 4092768131.172 |
| 501187233.627332 |  |  | 4142666088.644 |
| 506990708.274765 |  |  | 4193170854.605 |
| 512861383.991426 |  |  | 4244289791.573 |
| 518800038.929023 |  |  | 4296030351.207 |
| 524807460.249835 |  |  | 4348400075.392 |
| 530884444.231051 |  |  | 4401406597.323 |
| 537031796.370317 |  |  | 4455057642.61 |
| 543250331.492498 |  |  | 4509361030.398 |
| 549540873.85769 |  |  | 4564324674.492 |
| 555904257.27047 |  |  | 4619956584.507 |
| 562341325.190416 |  |  | 4676264867.018 |
| 568852930.843909 |  |  | 4733257726.74 |
| 575439937.337226 |  |  | 4790943467.706 |
| 582103217.770941 |  |  | 4849330494.473 |
| 588843655.355659 |  |  | 4908427313.334 |
| 595662143.529082 |  |  | 4968242533.546 |
| 602559586.07443 |  |  | 5028784868.578 |
| 609536897.240242 |  |  | 5090063137.365 |
| 616595001.861556 |  |  | 5152086265.586 |
| 623734835.482494 |  |  | 5214863286.951 |
| 630957344.480269 |  |  | 5278403344.508 |
| 638263486.190625 |  |  | 5342715691.964 |
| 645654229.034733 |  |  | 5407809695.02 |
| 653130552.647551 |  |  | 5473694832.725 |
| 660693448.007675 |  |  | 5540380698.845 |
| 668343917.568695 |  |  | 5607877003.25 |
| 676082975.392063 |  |  | 5676193573.313 |
| 683911647.281512 |  |  | 5745340355.333 |
| 691830970.91902 |  |  | 5815327415.972 |
| 699841996.002358 |  |  | 5886164943.703 |
| 707945784.384223 |  |  | 5957863250.289 |
| 716143410.212988 |  |  | 6030432772.265 |
| 724435960.075077 |  |  | 6103884072.451 |
| 732824533.138993 |  |  | 6178227841.473 |
| 741310241.301007 |  |  | 6253474899.309 |
| 749894209.332547 |  |  | 6329636196.849 |
| 758577575.029275 |  |  | 6406722817.479 |
| 767361489.361912 |  |  | 6484745978.678 |
| 776247116.628786 |  |  | 6563717033.64 |
| 785235634.610167 |  |  | 6643647472.91 |
| 794328234.724378 |  |  | 6724548926.047 |
| 803526122.185715 |  |  | 6806433163.297 |
| 812830516.164198 |  |  | 6889312097.297 |
| 822242649.947171 |  |  | 6973197784.79 |
| 831763771.102772 |  |  | 7058102428.371 |
| 841395141.645297 |  |  | 7144038378.242 |
| 851138038.20248 |  |  | 7231018133.996 |
| 860993752.184705 |  |  | 7319054346.423 |
| 870963589.956187 |  |  | 7408159819.334 |
| 881048873.008121 |  |  | 7498347511.409 |
| 891250938.133854 |  |  | 7589630538.064 |
| 901571137.606067 |  |  | 7682022173.348 |
| 912010839.356021 |  |  | 7775535851.855 |
| 922571427.154876 |  |  | 7870185170.665 |
| 933254300.797105 |  |  | 7965983891.301 |
| 944060876.286039 |  |  | 8062945941.717 |
| 954992586.021553 |  |  | 8161085418.311 |
| 966050878.989931 |  |  | 8260416587.949 |
| 977237220.95593 |  |  | 8360953890.032 |
| 988553094.65706 |  |  | 8462711938.575 |
| 1000000000.00012 |  |  | 8565705524.313 |
| 1011579454.26002 |  |  | 8669949616.838 |
| 1023292992.28088 |  |  | 8775459366.754 |
| 1035142166.67947 |  |  | 8882250107.865 |
| 1047128548.05103 |  |  | 8990337359.385 |
| 1059253725.17742 |  |  | 9099736828.175 |
| 1071519305.23774 |  |  | 9210464411.011 |
| 1083926914.02134 |  |  | 9322536196.872 |
| 1096478196.14332 |  |  | 9435968469.261 |
| 1109174815.26254 |  |  | 9550777708.555 |
| 1122018454.3021 |  |  | 9666980594.38 |
| 1135010815.67245 |  |  | 9784594008.013 |
| 1148153621.49702 |  |  | 9903635034.818 |
| 1161448613.84049 |  |  | 10024120966.71 |
| 1174897554.93967 |  |  | 10146069304.645 |
| 1188502227.43717 |  |  | 10269497761.143 |
| 1202264434.61756 |  |  | 10394424262.844 |
| 1216186000.64652 |  |  | 10520866953.087 |
| 1230268770.81253 |  |  | 10648844194.529 |
| 1244514611.77154 |  |  | 10778374571.789 |
| 1258925411.79432 |  |  | 10909476894.129 |
| 1273503081.01682 |  |  | 11042170198.159 |
| 1288249551.69329 |  |  | 11176473750.587 |
| 1303166778.45246 |  |  | 11312407050.991 |
| 1318256738.55657 |  |  | 11449989834.63 |
| 1333521432.16349 |  |  | 11589242075.288 |
| 1348962882.59182 |  |  | 11730183988.148 |
| 1364583136.58909 |  |  | 11872836032.712 |
| 1380384264.60306 |  |  | 12017218915.741 |
| 1396368361.05611 |  |  | 12163353594.242 |
| 1412537544.62293 |  |  | 12311261278.487 |
| 1428893958.51128 |  |  | 12460963435.065 |
| 1445439770.74611 |  |  | 12612481789.979 |
| 1462177174.4569 |  |  | 12765838331.772 |
| 1479108388.16839 |  |  | 12921055314.695 |
| 1496235656.09462 |  |  | 13078155261.911 |
| 1513561248.4364 |  |  | 13237160968.742 |
| 1531087461.68222 |  |  | 13398095505.948 |
| 1548816618.91267 |  |  | 13560982223.053 |
| 1566751070.10834 |  |  | 13725844751.705 |
| 1584893192.46131 |  |  | 13892707009.077 |
| 1603245390.69024 |  |  | 14061593201.318 |
| 1621810097.35913 |  |  | 14232527827.03 |
| 1640589773.19974 |  |  | 14405535680.802 |
| 1659586907.43777 |  |  | 14580641856.773 |
| 1678804018.12277 |  |  | 14757871752.254 |
| 1698243652.46196 |  |  | 14937251071.374 |
| 1717908387.1578 |  |  | 15118805828.789 |
| 1737800828.74959 |  |  | 15302562353.42 |
| 1757923613.95891 |  |  | 15488547292.25 |
| 1778279410.03915 |  |  | 15676787614.153 |
| 1798870915.12901 |  |  | 15867310613.778 |
| 1819700858.61021 |  |  | 16060143915.48 |
| 1840772001.46919 |  |  | 16255315477.293 |
| 1862087136.6631 |  |  | 16452853594.955 |
| 1883649089.49004 |  |  | 16652786905.979 |
| 1905460717.96349 |  |  | 16855144393.775 |
| 1927524913.19118 |  |  | 17059955391.822 |
| 1949844599.75829 |  |  | 17267249587.885 |
| 1972422736.1151 |  |  | 17477057028.292 |
| 1995262314.96913 |  |  | 17689408122.252 |
| 2018366363.68182 |  |  | 17904333646.236 |
| 2041737944.66979 |  |  | 18121864748.398 |
| 2065380155.81079 |  |  | 18342032953.064 |
| 2089296130.8543 |  |  | 18564870165.261 |
| 2113489039.83691 |  |  | 18790408675.309 |
| 2137962089.5025 |  |  | 19018681163.465 |
| 2162718523.72729 |  |  | 19249720704.629 |
| 2187761623.94983 |  |  | 19483560773.092 |
| 2213094709.60592 |  |  | 19720235247.361 |
| 2238721138.56862 |  |  | 19959778415.023 |
| 2264644307.59335 |  |  | 20202224977.684 |
| 2290867652.76806 |  |  | 20447610055.954 |
| 2317394649.96877 |  |  | 20695969194.499 |
| 2344228815.32022 |  |  | 20947338367.157 |
| 2371373705.66196 |  |  | 21201753982.102 |
| 2398832919.0198 |  |  | 21459252887.091 |
| 2426610095.08272 |  |  | 21719872374.753 |
| 2454708915.68534 |  |  | 21983650187.954 |
| 2483133105.29589 |  |  | 22250624525.225 |
| 2511886431.5099 |  |  | 22520834046.255 |
| 2540972705.54963 |  |  | 22794317877.445 |
| 2570395782.76919 |  |  | 23071115617.534 |
| 2600159563.1656 |  |  | 23351267343.296 |
| 2630267991.89572 |  |  | 23634813615.296 |
| 2660725059.79915 |  |  | 23921795483.723 |
| 2691534803.92726 |  |  | 24212254494.289 |
| 2722701308.07826 |  |  | 24506232694.203 |
| 2754228703.33852 |  |  | 24803772638.213 |
| 2786121168.63013 |  |  | 25104917394.721 |
| 2818382931.26481 |  |  | 25409710551.976 |
| 2851018267.50427 |  |  | 25718196224.335 |
| 2884031503.12698 |  |  | 26030419058.605 |
| 2917427014.00154 |  |  | 26346424240.458 |
| 2951209226.66677 |  |  | 26666257500.924 |
| 2985382618.91834 |  |  | 26989965122.961 |
| 3019951720.4024 |  |  | 27317593948.108 |
| 3054921113.21591 |  |  | 27649191383.215 |
| 3090295432.51399 |  |  | 27984805407.25 |
| 3126079367.12436 |  |  | 28324484578.199 |
| 3162277660.16879 |  |  | 28668278040.035 |
| 3198895109.69181 |  |  | 29016235529.786 |
| 3235936569.2967 |  |  | 29368407384.672 |
| 3273406948.7888 |  |  | 29724844549.34 |
| 3311311214.82634 |  |  | 30085598583.183 |
| 3349654391.57871 |  |  | 30450721667.744 |
| 3388441561.39246 |  |  | 30820266614.211 |
| 3427677865.46495 |  |  | 31194286871.003 |
| 3467368504.52577 |  |  | 31572836531.446 |
| 3507518739.52613 |  |  | 31955970341.542 |
| 3548133892.33621 |  |  | 32343743707.832 |
| 3589219346.45052 |  |  | 32736212705.35 |
| 3630780547.70148 |  |  | 33133434085.68 |
| 3672823004.98132 |  |  | 33535465285.1 |
| 3715352290.97221 |  |  | 33942364432.836 |
| 3758374042.88493 |  |  | 34354190359.4 |
| 3801893963.20611 |  |  | 34771002605.046 |
| 3845917820.45404 |  |  | 35192861428.311 |
| 3890451449.94331 |  |  | 35619827814.672 |
| 3935500754.55829 |  |  | 36051963485.297 |
| 3981071705.53549 |  |  | 36489330905.909 |
| 4027170343.25512 |  |  | 36931993295.752 |
| 4073802778.04166 |  |  | 37380014636.664 |
| 4120975190.97384 |  |  | 37833459682.265 |
| 4168693834.7039 |  |  | 38292393967.25 |
| 4216965034.28637 |  |  | 38756883816.794 |
| 4265795188.01648 |  |  | 39226996356.074 |
| 4315190768.27822 |  |  | 39702799519.9 |
| 4365158322.40223 |  |  | 40184362062.47 |
| 4415704473.5337 |  |  | 40671753567.23 |
| 4466835921.51022 |  |  | 41165044456.866 |
| 4518559443.74982 |  |  | 41664306003.406 |
| 4570881896.14935 |  |  | 42169610338.45 |
| 4623810213.99321 |  |  | 42681030463.519 |
| 4677351412.87259 |  |  | 43198640260.527 |
| 4731512589.61543 |  |  | 43722514502.388 |
| 4786300923.22701 |  |  | 44252728863.739 |
| 4841723675.84163 |  |  | 44789359931.798 |
| 4897788193.68511 |  |  | 45332485217.353 |
| 4954501908.04855 |  |  | 45882183165.882 |
| 5011872336.27338 |  |  | 46438533168.803 |
| 5069907082.74771 |  |  | 47001615574.868 |
| 5128613839.91432 |  |  | 47571511701.685 |
| 5188000389.29029 |  |  | 48148303847.381 |
| 5248074602.49842 |  |  | 48732075302.412 |
| 5308844442.31058 |  |  | 49322910361.504 |
| 5370317963.70324 |  |  | 49920894335.745 |
| 5432503314.92505 |  |  | 50526113564.82 |
| 5495408738.57697 |  |  | 51138655429.393 |
| 5559042572.70477 |  |  | 51758608363.64 |
| 5623413251.90423 |  |  | 52386061867.928 |
| 5688529308.43917 |  |  | 53021106521.652 |
| 5754399373.37233 |  |  | 53663833996.222 |
| 5821032177.70949 |  |  | 54314337068.206 |
| 5888436553.55667 |  |  | 54972709632.638 |
| 5956621435.2909 |  |  | 55639046716.474 |
| 6025595860.74438 |  |  | 56313444492.222 |
| 6095368972.4025 |  |  | 56996000291.725 |
| 6165950018.61564 |  |  | 57686812620.118 |
| 6237348354.82502 |  |  | 58385981169.952 |
| 6309573444.80277 |  |  | 59093606835.479 |
| 6382634861.90634 |  |  | 59809791727.118 |
| 6456542290.34742 |  |  | 60534639186.094 |
| 6531305526.47559 |  |  | 61268253799.246 |
| 6606934480.07684 |  |  | 62010741414.025 |
| 6683439175.68704 |  |  | 62762209153.655 |
| 6760829753.92072 |  |  | 63522765432.495 |
| 6839116472.81521 |  |  | 64292519971.572 |
| 6918309709.19029 |  |  | 65071583814.308 |
| 6998419960.02367 |  |  | 65860069342.431 |
| 7079457843.84233 |  |  | 66658090292.08 |
| 7161434102.12998 |  |  | 67465761770.105 |
| 7244359600.75087 |  |  | 68283200270.56 |
| 7328245331.39002 |  |  | 69110523691.395 |
| 7413102413.01017 |  |  | 69947851351.347 |
| 7498942093.32556 |  |  | 70795304007.04 |
| 7585775750.29286 |  |  | 71653003870.282 |
| 7673614893.61922 |  |  | 72521074625.576 |
| 7762471166.28796 |  |  | 73399641447.838 |
| 7852356346.10177 |  |  | 74288831020.332 |
| 7943282347.24388 |  |  | 75188771552.814 |
| 8035261221.85725 |  |  | 76099592799.902 |
| 8128305161.64209 |  |  | 77021426079.659 |
| 8222426499.47182 |  |  | 77954404292.403 |
| 8317637711.02783 |  |  | 78898661939.745 |
| 8413951416.45308 |  |  | 79854335143.85 |
| 8511380382.02491 |  |  | 80821561666.938 |
| 8609937521.84717 |  |  | 81800480931.008 |
| 8709635899.56198 |  |  | 82791234037.809 |
| 8810488730.08133 |  |  | 83793963789.046 |
| 8912509381.33866 |  |  | 84808814706.828 |
| 9015711376.06079 |  |  | 85835933054.367 |
| 9120108393.56033 |  |  | 86875466856.918 |
| 9225714271.54888 |  |  | 87927565922.978 |
| 9332543007.97117 |  |  | 88992381865.732 |
| 9440608762.86051 |  |  | 90070068124.764 |
| 9549925860.21565 |  |  | 91160779988.026 |
| 9660508789.89944 |  |  | 92264674614.068 |
| 9772372209.55943 |  |  | 93381911054.539 |
| 9885530946.57073 |  |  | 94512650276.954 |
| 10000000000.0014 |  |  | 95657055187.742 |